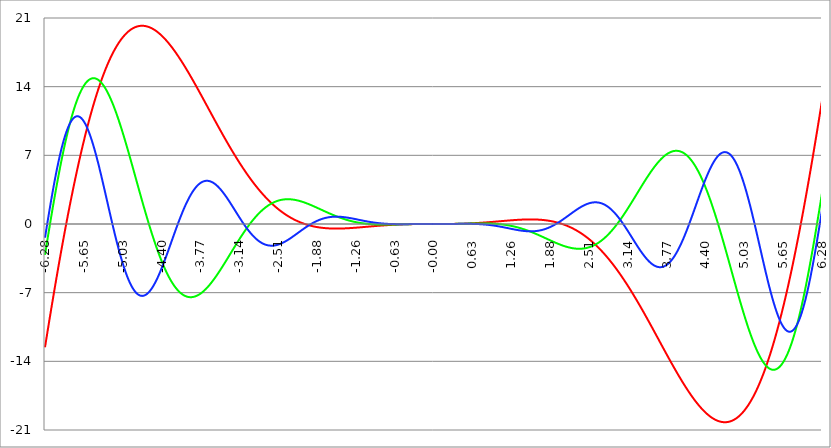
| Category | Series 1 | Series 0 | Series 2 |
|---|---|---|---|
| -6.283185307179586 | -12.566 | -3.142 | -1.396 |
| -6.276902121872407 | -12.319 | -2.894 | -1.148 |
| -6.270618936565228 | -12.071 | -2.647 | -0.901 |
| -6.264335751258049 | -11.824 | -2.4 | -0.655 |
| -6.25805256595087 | -11.578 | -2.154 | -0.409 |
| -6.25176938064369 | -11.333 | -1.908 | -0.164 |
| -6.245486195336511 | -11.087 | -1.664 | 0.08 |
| -6.23920301002933 | -10.843 | -1.42 | 0.323 |
| -6.232919824722153 | -10.599 | -1.176 | 0.565 |
| -6.226636639414973 | -10.355 | -0.934 | 0.806 |
| -6.220353454107794 | -10.112 | -0.692 | 1.045 |
| -6.214070268800615 | -9.87 | -0.451 | 1.283 |
| -6.207787083493435 | -9.628 | -0.212 | 1.52 |
| -6.201503898186257 | -9.387 | 0.027 | 1.755 |
| -6.195220712879077 | -9.146 | 0.265 | 1.989 |
| -6.188937527571898 | -8.907 | 0.502 | 2.221 |
| -6.182654342264719 | -8.667 | 0.738 | 2.451 |
| -6.17637115695754 | -8.429 | 0.973 | 2.679 |
| -6.170087971650361 | -8.191 | 1.206 | 2.906 |
| -6.163804786343182 | -7.953 | 1.439 | 3.13 |
| -6.157521601036002 | -7.717 | 1.67 | 3.353 |
| -6.151238415728823 | -7.481 | 1.9 | 3.573 |
| -6.144955230421644 | -7.245 | 2.129 | 3.792 |
| -6.138672045114464 | -7.011 | 2.357 | 4.008 |
| -6.132388859807286 | -6.777 | 2.583 | 4.221 |
| -6.126105674500106 | -6.543 | 2.808 | 4.433 |
| -6.119822489192927 | -6.311 | 3.032 | 4.642 |
| -6.113539303885748 | -6.079 | 3.254 | 4.848 |
| -6.107256118578569 | -5.848 | 3.475 | 5.052 |
| -6.10097293327139 | -5.618 | 3.694 | 5.253 |
| -6.09468974796421 | -5.388 | 3.912 | 5.451 |
| -6.088406562657031 | -5.159 | 4.128 | 5.647 |
| -6.082123377349852 | -4.931 | 4.343 | 5.84 |
| -6.075840192042672 | -4.704 | 4.556 | 6.03 |
| -6.069557006735494 | -4.477 | 4.767 | 6.217 |
| -6.063273821428314 | -4.251 | 4.977 | 6.401 |
| -6.056990636121135 | -4.026 | 5.185 | 6.582 |
| -6.050707450813956 | -3.802 | 5.392 | 6.76 |
| -6.044424265506777 | -3.578 | 5.596 | 6.934 |
| -6.038141080199597 | -3.356 | 5.799 | 7.106 |
| -6.031857894892418 | -3.134 | 6.001 | 7.274 |
| -6.025574709585239 | -2.913 | 6.2 | 7.439 |
| -6.01929152427806 | -2.693 | 6.398 | 7.601 |
| -6.013008338970881 | -2.473 | 6.593 | 7.759 |
| -6.006725153663701 | -2.255 | 6.787 | 7.914 |
| -6.000441968356522 | -2.037 | 6.979 | 8.065 |
| -5.994158783049343 | -1.82 | 7.169 | 8.213 |
| -5.987875597742164 | -1.604 | 7.357 | 8.357 |
| -5.981592412434984 | -1.389 | 7.543 | 8.498 |
| -5.975309227127805 | -1.175 | 7.728 | 8.635 |
| -5.969026041820626 | -0.962 | 7.91 | 8.769 |
| -5.962742856513447 | -0.749 | 8.09 | 8.898 |
| -5.956459671206268 | -0.538 | 8.268 | 9.024 |
| -5.950176485899088 | -0.327 | 8.444 | 9.147 |
| -5.94389330059191 | -0.117 | 8.618 | 9.265 |
| -5.93761011528473 | 0.092 | 8.789 | 9.38 |
| -5.931326929977551 | 0.3 | 8.959 | 9.491 |
| -5.925043744670372 | 0.507 | 9.126 | 9.598 |
| -5.918760559363193 | 0.713 | 9.292 | 9.701 |
| -5.912477374056014 | 0.918 | 9.455 | 9.8 |
| -5.906194188748834 | 1.122 | 9.616 | 9.895 |
| -5.899911003441655 | 1.326 | 9.774 | 9.987 |
| -5.893627818134476 | 1.528 | 9.931 | 10.074 |
| -5.887344632827297 | 1.729 | 10.085 | 10.157 |
| -5.881061447520117 | 1.93 | 10.237 | 10.237 |
| -5.874778262212938 | 2.129 | 10.386 | 10.312 |
| -5.868495076905759 | 2.328 | 10.534 | 10.384 |
| -5.86221189159858 | 2.525 | 10.679 | 10.451 |
| -5.855928706291401 | 2.722 | 10.821 | 10.515 |
| -5.849645520984221 | 2.918 | 10.962 | 10.574 |
| -5.843362335677042 | 3.112 | 11.1 | 10.629 |
| -5.837079150369863 | 3.306 | 11.235 | 10.681 |
| -5.830795965062684 | 3.498 | 11.368 | 10.728 |
| -5.824512779755505 | 3.69 | 11.499 | 10.771 |
| -5.818229594448325 | 3.881 | 11.627 | 10.811 |
| -5.811946409141146 | 4.07 | 11.753 | 10.846 |
| -5.805663223833967 | 4.259 | 11.877 | 10.877 |
| -5.799380038526788 | 4.446 | 11.998 | 10.904 |
| -5.793096853219609 | 4.633 | 12.117 | 10.927 |
| -5.78681366791243 | 4.819 | 12.233 | 10.946 |
| -5.780530482605251 | 5.003 | 12.347 | 10.962 |
| -5.774247297298071 | 5.186 | 12.458 | 10.973 |
| -5.767964111990892 | 5.369 | 12.567 | 10.98 |
| -5.761680926683713 | 5.55 | 12.673 | 10.983 |
| -5.755397741376534 | 5.731 | 12.777 | 10.983 |
| -5.749114556069355 | 5.91 | 12.878 | 10.978 |
| -5.742831370762175 | 6.088 | 12.977 | 10.97 |
| -5.736548185454996 | 6.265 | 13.073 | 10.957 |
| -5.730265000147816 | 6.441 | 13.167 | 10.941 |
| -5.723981814840638 | 6.616 | 13.258 | 10.921 |
| -5.717698629533459 | 6.79 | 13.347 | 10.897 |
| -5.711415444226279 | 6.963 | 13.433 | 10.87 |
| -5.7051322589191 | 7.135 | 13.517 | 10.838 |
| -5.698849073611921 | 7.306 | 13.598 | 10.803 |
| -5.692565888304742 | 7.476 | 13.676 | 10.764 |
| -5.686282702997562 | 7.644 | 13.753 | 10.722 |
| -5.679999517690383 | 7.812 | 13.826 | 10.676 |
| -5.673716332383204 | 7.978 | 13.897 | 10.626 |
| -5.667433147076025 | 8.143 | 13.965 | 10.573 |
| -5.661149961768846 | 8.307 | 14.031 | 10.516 |
| -5.654866776461667 | 8.471 | 14.095 | 10.455 |
| -5.648583591154487 | 8.633 | 14.156 | 10.392 |
| -5.642300405847308 | 8.793 | 14.214 | 10.324 |
| -5.63601722054013 | 8.953 | 14.27 | 10.254 |
| -5.62973403523295 | 9.112 | 14.323 | 10.18 |
| -5.623450849925771 | 9.269 | 14.373 | 10.102 |
| -5.617167664618591 | 9.426 | 14.422 | 10.022 |
| -5.610884479311412 | 9.581 | 14.467 | 9.938 |
| -5.604601294004233 | 9.735 | 14.51 | 9.851 |
| -5.598318108697054 | 9.889 | 14.551 | 9.761 |
| -5.592034923389875 | 10.04 | 14.589 | 9.668 |
| -5.585751738082695 | 10.191 | 14.625 | 9.572 |
| -5.579468552775516 | 10.341 | 14.658 | 9.473 |
| -5.573185367468337 | 10.49 | 14.688 | 9.371 |
| -5.566902182161157 | 10.637 | 14.716 | 9.266 |
| -5.560618996853979 | 10.783 | 14.742 | 9.158 |
| -5.5543358115468 | 10.928 | 14.765 | 9.047 |
| -5.54805262623962 | 11.072 | 14.786 | 8.934 |
| -5.54176944093244 | 11.215 | 14.804 | 8.818 |
| -5.535486255625262 | 11.357 | 14.82 | 8.699 |
| -5.529203070318083 | 11.498 | 14.833 | 8.578 |
| -5.522919885010904 | 11.637 | 14.844 | 8.455 |
| -5.516636699703724 | 11.775 | 14.852 | 8.328 |
| -5.510353514396545 | 11.913 | 14.858 | 8.2 |
| -5.504070329089366 | 12.049 | 14.862 | 8.069 |
| -5.497787143782186 | 12.184 | 14.863 | 7.936 |
| -5.491503958475008 | 12.317 | 14.862 | 7.8 |
| -5.485220773167828 | 12.45 | 14.858 | 7.663 |
| -5.47893758786065 | 12.581 | 14.852 | 7.523 |
| -5.47265440255347 | 12.711 | 14.844 | 7.381 |
| -5.466371217246291 | 12.841 | 14.833 | 7.238 |
| -5.460088031939112 | 12.968 | 14.82 | 7.092 |
| -5.453804846631932 | 13.095 | 14.805 | 6.945 |
| -5.447521661324753 | 13.221 | 14.787 | 6.795 |
| -5.441238476017574 | 13.345 | 14.768 | 6.644 |
| -5.434955290710395 | 13.469 | 14.745 | 6.492 |
| -5.428672105403215 | 13.591 | 14.721 | 6.337 |
| -5.422388920096036 | 13.712 | 14.694 | 6.182 |
| -5.416105734788857 | 13.832 | 14.666 | 6.024 |
| -5.409822549481678 | 13.95 | 14.634 | 5.865 |
| -5.403539364174499 | 14.068 | 14.601 | 5.705 |
| -5.39725617886732 | 14.184 | 14.566 | 5.544 |
| -5.39097299356014 | 14.299 | 14.528 | 5.381 |
| -5.384689808252961 | 14.414 | 14.488 | 5.218 |
| -5.378406622945782 | 14.526 | 14.446 | 5.053 |
| -5.372123437638603 | 14.638 | 14.402 | 4.887 |
| -5.365840252331424 | 14.749 | 14.356 | 4.72 |
| -5.359557067024244 | 14.858 | 14.308 | 4.552 |
| -5.353273881717065 | 14.966 | 14.258 | 4.383 |
| -5.346990696409886 | 15.073 | 14.205 | 4.214 |
| -5.340707511102707 | 15.179 | 14.151 | 4.044 |
| -5.334424325795528 | 15.284 | 14.095 | 3.873 |
| -5.328141140488348 | 15.388 | 14.036 | 3.702 |
| -5.32185795518117 | 15.49 | 13.976 | 3.53 |
| -5.31557476987399 | 15.591 | 13.914 | 3.358 |
| -5.30929158456681 | 15.692 | 13.849 | 3.185 |
| -5.303008399259631 | 15.791 | 13.783 | 3.012 |
| -5.296725213952453 | 15.888 | 13.715 | 2.839 |
| -5.290442028645273 | 15.985 | 13.645 | 2.665 |
| -5.284158843338094 | 16.081 | 13.573 | 2.492 |
| -5.277875658030915 | 16.175 | 13.5 | 2.318 |
| -5.271592472723735 | 16.268 | 13.424 | 2.144 |
| -5.265309287416557 | 16.36 | 13.347 | 1.971 |
| -5.259026102109377 | 16.451 | 13.268 | 1.797 |
| -5.252742916802198 | 16.541 | 13.187 | 1.624 |
| -5.246459731495019 | 16.629 | 13.105 | 1.451 |
| -5.24017654618784 | 16.717 | 13.021 | 1.278 |
| -5.23389336088066 | 16.803 | 12.935 | 1.106 |
| -5.227610175573481 | 16.888 | 12.847 | 0.934 |
| -5.221326990266302 | 16.972 | 12.758 | 0.763 |
| -5.215043804959122 | 17.055 | 12.668 | 0.592 |
| -5.208760619651944 | 17.137 | 12.575 | 0.422 |
| -5.202477434344764 | 17.218 | 12.481 | 0.252 |
| -5.196194249037585 | 17.297 | 12.386 | 0.083 |
| -5.189911063730406 | 17.375 | 12.289 | -0.085 |
| -5.183627878423227 | 17.453 | 12.19 | -0.252 |
| -5.177344693116048 | 17.529 | 12.09 | -0.418 |
| -5.171061507808868 | 17.604 | 11.989 | -0.583 |
| -5.164778322501689 | 17.678 | 11.886 | -0.748 |
| -5.15849513719451 | 17.75 | 11.782 | -0.911 |
| -5.152211951887331 | 17.822 | 11.676 | -1.073 |
| -5.145928766580152 | 17.892 | 11.569 | -1.234 |
| -5.139645581272972 | 17.962 | 11.461 | -1.394 |
| -5.133362395965793 | 18.03 | 11.351 | -1.552 |
| -5.127079210658614 | 18.097 | 11.24 | -1.709 |
| -5.120796025351435 | 18.163 | 11.128 | -1.865 |
| -5.114512840044256 | 18.228 | 11.015 | -2.019 |
| -5.108229654737076 | 18.292 | 10.9 | -2.172 |
| -5.101946469429897 | 18.354 | 10.784 | -2.323 |
| -5.095663284122718 | 18.416 | 10.667 | -2.473 |
| -5.08938009881554 | 18.476 | 10.549 | -2.621 |
| -5.08309691350836 | 18.536 | 10.43 | -2.768 |
| -5.07681372820118 | 18.594 | 10.31 | -2.912 |
| -5.070530542894002 | 18.651 | 10.189 | -3.055 |
| -5.064247357586822 | 18.707 | 10.066 | -3.196 |
| -5.057964172279643 | 18.762 | 9.943 | -3.336 |
| -5.051680986972464 | 18.816 | 9.819 | -3.473 |
| -5.045397801665285 | 18.869 | 9.693 | -3.609 |
| -5.039114616358106 | 18.921 | 9.567 | -3.742 |
| -5.032831431050926 | 18.971 | 9.44 | -3.874 |
| -5.026548245743747 | 19.021 | 9.312 | -4.003 |
| -5.020265060436568 | 19.069 | 9.183 | -4.131 |
| -5.013981875129389 | 19.117 | 9.053 | -4.256 |
| -5.00769868982221 | 19.163 | 8.923 | -4.379 |
| -5.00141550451503 | 19.209 | 8.792 | -4.5 |
| -4.995132319207851 | 19.253 | 8.66 | -4.619 |
| -4.98884913390067 | 19.296 | 8.527 | -4.735 |
| -4.982565948593493 | 19.338 | 8.393 | -4.849 |
| -4.976282763286313 | 19.379 | 8.259 | -4.961 |
| -4.969999577979134 | 19.419 | 8.125 | -5.071 |
| -4.963716392671955 | 19.458 | 7.989 | -5.178 |
| -4.957433207364776 | 19.496 | 7.853 | -5.283 |
| -4.951150022057597 | 19.533 | 7.717 | -5.385 |
| -4.944866836750418 | 19.569 | 7.58 | -5.485 |
| -4.938583651443238 | 19.604 | 7.442 | -5.582 |
| -4.932300466136059 | 19.638 | 7.304 | -5.677 |
| -4.92601728082888 | 19.671 | 7.166 | -5.77 |
| -4.9197340955217 | 19.703 | 7.027 | -5.86 |
| -4.913450910214521 | 19.733 | 6.887 | -5.947 |
| -4.907167724907342 | 19.763 | 6.747 | -6.032 |
| -4.900884539600163 | 19.792 | 6.607 | -6.114 |
| -4.894601354292984 | 19.82 | 6.467 | -6.193 |
| -4.888318168985805 | 19.847 | 6.326 | -6.27 |
| -4.882034983678625 | 19.872 | 6.185 | -6.345 |
| -4.875751798371446 | 19.897 | 6.044 | -6.416 |
| -4.869468613064267 | 19.921 | 5.902 | -6.485 |
| -4.863185427757088 | 19.944 | 5.76 | -6.551 |
| -4.856902242449909 | 19.966 | 5.618 | -6.615 |
| -4.85061905714273 | 19.986 | 5.476 | -6.676 |
| -4.84433587183555 | 20.006 | 5.334 | -6.734 |
| -4.838052686528371 | 20.025 | 5.191 | -6.79 |
| -4.831769501221192 | 20.043 | 5.049 | -6.842 |
| -4.825486315914013 | 20.06 | 4.906 | -6.893 |
| -4.819203130606833 | 20.076 | 4.764 | -6.94 |
| -4.812919945299654 | 20.091 | 4.621 | -6.984 |
| -4.806636759992475 | 20.105 | 4.479 | -7.026 |
| -4.800353574685296 | 20.119 | 4.336 | -7.065 |
| -4.794070389378117 | 20.131 | 4.193 | -7.102 |
| -4.787787204070938 | 20.142 | 4.051 | -7.136 |
| -4.781504018763758 | 20.153 | 3.909 | -7.166 |
| -4.77522083345658 | 20.162 | 3.766 | -7.195 |
| -4.7689376481494 | 20.171 | 3.624 | -7.22 |
| -4.762654462842221 | 20.178 | 3.482 | -7.243 |
| -4.756371277535042 | 20.185 | 3.341 | -7.263 |
| -4.750088092227862 | 20.191 | 3.199 | -7.28 |
| -4.743804906920683 | 20.196 | 3.058 | -7.295 |
| -4.737521721613504 | 20.2 | 2.917 | -7.307 |
| -4.731238536306324 | 20.203 | 2.776 | -7.316 |
| -4.724955350999146 | 20.205 | 2.636 | -7.323 |
| -4.718672165691966 | 20.206 | 2.496 | -7.327 |
| -4.712388980384787 | 20.207 | 2.356 | -7.328 |
| -4.706105795077608 | 20.206 | 2.217 | -7.327 |
| -4.699822609770429 | 20.205 | 2.078 | -7.323 |
| -4.69353942446325 | 20.203 | 1.939 | -7.316 |
| -4.68725623915607 | 20.2 | 1.801 | -7.307 |
| -4.680973053848891 | 20.196 | 1.664 | -7.296 |
| -4.674689868541712 | 20.191 | 1.526 | -7.281 |
| -4.668406683234533 | 20.185 | 1.39 | -7.265 |
| -4.662123497927354 | 20.179 | 1.254 | -7.245 |
| -4.655840312620174 | 20.172 | 1.118 | -7.224 |
| -4.649557127312995 | 20.164 | 0.983 | -7.199 |
| -4.643273942005816 | 20.155 | 0.849 | -7.173 |
| -4.636990756698637 | 20.145 | 0.715 | -7.144 |
| -4.630707571391458 | 20.134 | 0.581 | -7.112 |
| -4.624424386084279 | 20.123 | 0.449 | -7.078 |
| -4.618141200777099 | 20.111 | 0.317 | -7.042 |
| -4.61185801546992 | 20.098 | 0.186 | -7.003 |
| -4.605574830162741 | 20.084 | 0.055 | -6.963 |
| -4.599291644855561 | 20.069 | -0.075 | -6.919 |
| -4.593008459548383 | 20.054 | -0.204 | -6.874 |
| -4.586725274241203 | 20.038 | -0.332 | -6.827 |
| -4.580442088934024 | 20.021 | -0.46 | -6.777 |
| -4.574158903626845 | 20.003 | -0.587 | -6.725 |
| -4.567875718319666 | 19.984 | -0.713 | -6.671 |
| -4.561592533012487 | 19.965 | -0.838 | -6.615 |
| -4.555309347705307 | 19.945 | -0.963 | -6.557 |
| -4.549026162398128 | 19.924 | -1.086 | -6.496 |
| -4.542742977090949 | 19.903 | -1.209 | -6.434 |
| -4.53645979178377 | 19.881 | -1.331 | -6.37 |
| -4.530176606476591 | 19.858 | -1.452 | -6.304 |
| -4.523893421169412 | 19.834 | -1.572 | -6.236 |
| -4.517610235862232 | 19.809 | -1.691 | -6.166 |
| -4.511327050555053 | 19.784 | -1.809 | -6.095 |
| -4.505043865247874 | 19.758 | -1.926 | -6.021 |
| -4.498760679940694 | 19.732 | -2.042 | -5.946 |
| -4.492477494633515 | 19.704 | -2.158 | -5.869 |
| -4.486194309326336 | 19.676 | -2.272 | -5.791 |
| -4.479911124019157 | 19.648 | -2.385 | -5.71 |
| -4.473627938711977 | 19.618 | -2.497 | -5.629 |
| -4.467344753404799 | 19.588 | -2.609 | -5.545 |
| -4.46106156809762 | 19.558 | -2.719 | -5.46 |
| -4.45477838279044 | 19.526 | -2.828 | -5.374 |
| -4.44849519748326 | 19.494 | -2.936 | -5.286 |
| -4.442212012176082 | 19.461 | -3.043 | -5.197 |
| -4.435928826868903 | 19.428 | -3.148 | -5.107 |
| -4.429645641561723 | 19.394 | -3.253 | -5.015 |
| -4.423362456254544 | 19.359 | -3.356 | -4.922 |
| -4.417079270947365 | 19.324 | -3.459 | -4.827 |
| -4.410796085640185 | 19.288 | -3.56 | -4.732 |
| -4.404512900333007 | 19.251 | -3.66 | -4.635 |
| -4.398229715025827 | 19.214 | -3.759 | -4.537 |
| -4.391946529718648 | 19.176 | -3.857 | -4.438 |
| -4.38566334441147 | 19.137 | -3.953 | -4.339 |
| -4.37938015910429 | 19.098 | -4.049 | -4.238 |
| -4.373096973797111 | 19.059 | -4.143 | -4.136 |
| -4.366813788489932 | 19.018 | -4.236 | -4.033 |
| -4.360530603182752 | 18.977 | -4.328 | -3.93 |
| -4.354247417875573 | 18.936 | -4.418 | -3.825 |
| -4.347964232568394 | 18.894 | -4.507 | -3.72 |
| -4.341681047261215 | 18.851 | -4.595 | -3.614 |
| -4.335397861954035 | 18.808 | -4.682 | -3.508 |
| -4.329114676646856 | 18.764 | -4.767 | -3.401 |
| -4.322831491339677 | 18.72 | -4.852 | -3.293 |
| -4.316548306032498 | 18.675 | -4.934 | -3.185 |
| -4.310265120725319 | 18.63 | -5.016 | -3.076 |
| -4.30398193541814 | 18.584 | -5.096 | -2.966 |
| -4.29769875011096 | 18.537 | -5.175 | -2.857 |
| -4.291415564803781 | 18.49 | -5.253 | -2.747 |
| -4.285132379496602 | 18.443 | -5.33 | -2.636 |
| -4.278849194189422 | 18.395 | -5.405 | -2.525 |
| -4.272566008882244 | 18.346 | -5.478 | -2.414 |
| -4.266282823575064 | 18.297 | -5.551 | -2.303 |
| -4.259999638267885 | 18.247 | -5.622 | -2.192 |
| -4.253716452960706 | 18.197 | -5.692 | -2.08 |
| -4.247433267653527 | 18.147 | -5.76 | -1.969 |
| -4.241150082346347 | 18.096 | -5.827 | -1.857 |
| -4.234866897039168 | 18.044 | -5.893 | -1.746 |
| -4.228583711731989 | 17.992 | -5.958 | -1.634 |
| -4.22230052642481 | 17.94 | -6.021 | -1.523 |
| -4.216017341117631 | 17.887 | -6.082 | -1.411 |
| -4.209734155810452 | 17.833 | -6.143 | -1.3 |
| -4.203450970503273 | 17.779 | -6.202 | -1.189 |
| -4.197167785196093 | 17.725 | -6.259 | -1.078 |
| -4.190884599888914 | 17.67 | -6.315 | -0.968 |
| -4.184601414581734 | 17.615 | -6.37 | -0.857 |
| -4.178318229274556 | 17.56 | -6.424 | -0.748 |
| -4.172035043967377 | 17.503 | -6.476 | -0.638 |
| -4.165751858660197 | 17.447 | -6.527 | -0.529 |
| -4.159468673353018 | 17.39 | -6.576 | -0.421 |
| -4.153185488045839 | 17.333 | -6.624 | -0.313 |
| -4.14690230273866 | 17.275 | -6.671 | -0.205 |
| -4.140619117431481 | 17.217 | -6.716 | -0.098 |
| -4.134335932124301 | 17.159 | -6.76 | 0.008 |
| -4.128052746817122 | 17.1 | -6.803 | 0.114 |
| -4.121769561509943 | 17.04 | -6.844 | 0.219 |
| -4.115486376202764 | 16.981 | -6.884 | 0.323 |
| -4.109203190895584 | 16.921 | -6.922 | 0.426 |
| -4.102920005588405 | 16.86 | -6.96 | 0.529 |
| -4.096636820281226 | 16.8 | -6.995 | 0.631 |
| -4.090353634974047 | 16.739 | -7.03 | 0.732 |
| -4.084070449666868 | 16.677 | -7.063 | 0.832 |
| -4.077787264359689 | 16.615 | -7.095 | 0.931 |
| -4.071504079052509 | 16.553 | -7.125 | 1.03 |
| -4.06522089374533 | 16.491 | -7.154 | 1.127 |
| -4.058937708438151 | 16.428 | -7.182 | 1.223 |
| -4.052654523130972 | 16.365 | -7.208 | 1.318 |
| -4.046371337823793 | 16.302 | -7.233 | 1.412 |
| -4.040088152516613 | 16.238 | -7.257 | 1.506 |
| -4.033804967209434 | 16.174 | -7.279 | 1.598 |
| -4.027521781902255 | 16.11 | -7.3 | 1.688 |
| -4.021238596595076 | 16.045 | -7.32 | 1.778 |
| -4.014955411287897 | 15.98 | -7.338 | 1.866 |
| -4.008672225980717 | 15.915 | -7.355 | 1.954 |
| -4.002389040673538 | 15.849 | -7.371 | 2.04 |
| -3.996105855366359 | 15.784 | -7.385 | 2.124 |
| -3.989822670059179 | 15.718 | -7.399 | 2.208 |
| -3.983539484752 | 15.651 | -7.41 | 2.29 |
| -3.97725629944482 | 15.585 | -7.421 | 2.37 |
| -3.97097311413764 | 15.518 | -7.43 | 2.45 |
| -3.96468992883046 | 15.451 | -7.438 | 2.528 |
| -3.958406743523281 | 15.384 | -7.445 | 2.604 |
| -3.952123558216101 | 15.316 | -7.451 | 2.679 |
| -3.945840372908922 | 15.248 | -7.455 | 2.753 |
| -3.939557187601742 | 15.18 | -7.458 | 2.825 |
| -3.933274002294562 | 15.112 | -7.46 | 2.896 |
| -3.926990816987382 | 15.044 | -7.461 | 2.965 |
| -3.920707631680203 | 14.975 | -7.46 | 3.033 |
| -3.914424446373023 | 14.906 | -7.458 | 3.099 |
| -3.908141261065844 | 14.837 | -7.455 | 3.164 |
| -3.901858075758664 | 14.768 | -7.451 | 3.227 |
| -3.895574890451484 | 14.699 | -7.446 | 3.289 |
| -3.889291705144305 | 14.629 | -7.439 | 3.349 |
| -3.883008519837125 | 14.559 | -7.431 | 3.407 |
| -3.876725334529945 | 14.489 | -7.422 | 3.464 |
| -3.870442149222766 | 14.419 | -7.412 | 3.519 |
| -3.864158963915586 | 14.349 | -7.401 | 3.573 |
| -3.857875778608407 | 14.279 | -7.389 | 3.625 |
| -3.851592593301227 | 14.208 | -7.375 | 3.675 |
| -3.845309407994047 | 14.137 | -7.361 | 3.723 |
| -3.839026222686868 | 14.066 | -7.345 | 3.77 |
| -3.832743037379688 | 13.995 | -7.328 | 3.816 |
| -3.826459852072508 | 13.924 | -7.311 | 3.859 |
| -3.820176666765329 | 13.853 | -7.292 | 3.901 |
| -3.813893481458149 | 13.781 | -7.272 | 3.942 |
| -3.807610296150969 | 13.71 | -7.251 | 3.98 |
| -3.80132711084379 | 13.638 | -7.229 | 4.017 |
| -3.79504392553661 | 13.566 | -7.205 | 4.052 |
| -3.78876074022943 | 13.494 | -7.181 | 4.086 |
| -3.782477554922251 | 13.422 | -7.156 | 4.118 |
| -3.776194369615071 | 13.35 | -7.13 | 4.148 |
| -3.769911184307892 | 13.278 | -7.103 | 4.176 |
| -3.763627999000712 | 13.206 | -7.075 | 4.203 |
| -3.757344813693532 | 13.133 | -7.046 | 4.228 |
| -3.751061628386352 | 13.061 | -7.016 | 4.251 |
| -3.744778443079173 | 12.988 | -6.985 | 4.273 |
| -3.738495257771993 | 12.916 | -6.953 | 4.293 |
| -3.732212072464814 | 12.843 | -6.92 | 4.311 |
| -3.725928887157634 | 12.77 | -6.887 | 4.328 |
| -3.719645701850454 | 12.698 | -6.852 | 4.343 |
| -3.713362516543275 | 12.625 | -6.817 | 4.356 |
| -3.707079331236095 | 12.552 | -6.78 | 4.368 |
| -3.700796145928915 | 12.479 | -6.743 | 4.378 |
| -3.694512960621736 | 12.406 | -6.705 | 4.386 |
| -3.688229775314556 | 12.333 | -6.666 | 4.393 |
| -3.681946590007376 | 12.26 | -6.626 | 4.398 |
| -3.675663404700197 | 12.187 | -6.586 | 4.402 |
| -3.669380219393017 | 12.114 | -6.545 | 4.403 |
| -3.663097034085838 | 12.041 | -6.503 | 4.404 |
| -3.656813848778658 | 11.968 | -6.46 | 4.402 |
| -3.650530663471478 | 11.895 | -6.416 | 4.399 |
| -3.644247478164299 | 11.821 | -6.372 | 4.395 |
| -3.63796429285712 | 11.748 | -6.327 | 4.389 |
| -3.631681107549939 | 11.675 | -6.281 | 4.381 |
| -3.62539792224276 | 11.602 | -6.234 | 4.372 |
| -3.61911473693558 | 11.529 | -6.187 | 4.362 |
| -3.612831551628401 | 11.456 | -6.139 | 4.35 |
| -3.606548366321221 | 11.383 | -6.091 | 4.336 |
| -3.600265181014041 | 11.31 | -6.042 | 4.321 |
| -3.593981995706862 | 11.237 | -5.992 | 4.305 |
| -3.587698810399682 | 11.164 | -5.941 | 4.287 |
| -3.581415625092502 | 11.091 | -5.89 | 4.267 |
| -3.575132439785323 | 11.018 | -5.839 | 4.247 |
| -3.568849254478143 | 10.945 | -5.786 | 4.225 |
| -3.562566069170964 | 10.872 | -5.734 | 4.201 |
| -3.556282883863784 | 10.8 | -5.68 | 4.176 |
| -3.549999698556604 | 10.727 | -5.626 | 4.15 |
| -3.543716513249425 | 10.654 | -5.572 | 4.123 |
| -3.537433327942245 | 10.582 | -5.517 | 4.094 |
| -3.531150142635065 | 10.509 | -5.461 | 4.064 |
| -3.524866957327886 | 10.437 | -5.405 | 4.032 |
| -3.518583772020706 | 10.364 | -5.349 | 4 |
| -3.512300586713526 | 10.292 | -5.292 | 3.966 |
| -3.506017401406347 | 10.22 | -5.234 | 3.931 |
| -3.499734216099167 | 10.148 | -5.177 | 3.895 |
| -3.493451030791987 | 10.076 | -5.118 | 3.858 |
| -3.487167845484808 | 10.004 | -5.06 | 3.82 |
| -3.480884660177628 | 9.932 | -5.001 | 3.78 |
| -3.474601474870449 | 9.86 | -4.941 | 3.74 |
| -3.468318289563269 | 9.788 | -4.881 | 3.698 |
| -3.462035104256089 | 9.717 | -4.821 | 3.656 |
| -3.45575191894891 | 9.646 | -4.761 | 3.612 |
| -3.44946873364173 | 9.574 | -4.7 | 3.567 |
| -3.44318554833455 | 9.503 | -4.639 | 3.522 |
| -3.436902363027371 | 9.432 | -4.577 | 3.475 |
| -3.430619177720191 | 9.361 | -4.515 | 3.428 |
| -3.424335992413011 | 9.29 | -4.453 | 3.38 |
| -3.418052807105832 | 9.22 | -4.391 | 3.33 |
| -3.411769621798652 | 9.149 | -4.328 | 3.28 |
| -3.405486436491473 | 9.079 | -4.265 | 3.23 |
| -3.399203251184293 | 9.008 | -4.202 | 3.178 |
| -3.392920065877113 | 8.938 | -4.139 | 3.126 |
| -3.386636880569934 | 8.868 | -4.076 | 3.073 |
| -3.380353695262754 | 8.798 | -4.012 | 3.019 |
| -3.374070509955574 | 8.729 | -3.948 | 2.964 |
| -3.367787324648395 | 8.659 | -3.884 | 2.909 |
| -3.361504139341215 | 8.59 | -3.82 | 2.853 |
| -3.355220954034035 | 8.521 | -3.756 | 2.797 |
| -3.348937768726855 | 8.452 | -3.691 | 2.74 |
| -3.342654583419676 | 8.383 | -3.627 | 2.682 |
| -3.336371398112496 | 8.314 | -3.562 | 2.624 |
| -3.330088212805317 | 8.245 | -3.497 | 2.566 |
| -3.323805027498137 | 8.177 | -3.432 | 2.507 |
| -3.317521842190957 | 8.109 | -3.368 | 2.447 |
| -3.311238656883778 | 8.041 | -3.303 | 2.387 |
| -3.304955471576598 | 7.973 | -3.238 | 2.327 |
| -3.298672286269419 | 7.905 | -3.173 | 2.266 |
| -3.292389100962239 | 7.838 | -3.108 | 2.205 |
| -3.286105915655059 | 7.771 | -3.043 | 2.144 |
| -3.27982273034788 | 7.704 | -2.978 | 2.082 |
| -3.2735395450407 | 7.637 | -2.912 | 2.02 |
| -3.26725635973352 | 7.57 | -2.848 | 1.958 |
| -3.260973174426341 | 7.504 | -2.783 | 1.895 |
| -3.254689989119161 | 7.438 | -2.718 | 1.833 |
| -3.248406803811982 | 7.372 | -2.653 | 1.77 |
| -3.242123618504802 | 7.306 | -2.588 | 1.707 |
| -3.235840433197622 | 7.24 | -2.523 | 1.644 |
| -3.229557247890442 | 7.175 | -2.459 | 1.58 |
| -3.223274062583263 | 7.11 | -2.394 | 1.517 |
| -3.216990877276083 | 7.045 | -2.33 | 1.454 |
| -3.210707691968904 | 6.98 | -2.266 | 1.39 |
| -3.204424506661724 | 6.915 | -2.202 | 1.327 |
| -3.198141321354544 | 6.851 | -2.138 | 1.264 |
| -3.191858136047365 | 6.787 | -2.074 | 1.2 |
| -3.185574950740185 | 6.723 | -2.01 | 1.137 |
| -3.179291765433005 | 6.66 | -1.947 | 1.074 |
| -3.173008580125826 | 6.596 | -1.884 | 1.011 |
| -3.166725394818646 | 6.533 | -1.821 | 0.948 |
| -3.160442209511467 | 6.47 | -1.758 | 0.885 |
| -3.154159024204287 | 6.408 | -1.695 | 0.823 |
| -3.147875838897107 | 6.345 | -1.633 | 0.76 |
| -3.141592653589928 | 6.283 | -1.571 | 0.698 |
| -3.135309468282748 | 6.221 | -1.509 | 0.636 |
| -3.129026282975568 | 6.16 | -1.447 | 0.575 |
| -3.122743097668389 | 6.098 | -1.386 | 0.513 |
| -3.116459912361209 | 6.037 | -1.325 | 0.452 |
| -3.110176727054029 | 5.976 | -1.264 | 0.392 |
| -3.10389354174685 | 5.916 | -1.204 | 0.331 |
| -3.09761035643967 | 5.855 | -1.143 | 0.271 |
| -3.09132717113249 | 5.795 | -1.083 | 0.212 |
| -3.085043985825311 | 5.735 | -1.024 | 0.153 |
| -3.078760800518131 | 5.676 | -0.965 | 0.094 |
| -3.072477615210952 | 5.616 | -0.906 | 0.036 |
| -3.066194429903772 | 5.557 | -0.847 | -0.022 |
| -3.059911244596592 | 5.499 | -0.789 | -0.08 |
| -3.053628059289413 | 5.44 | -0.731 | -0.136 |
| -3.047344873982233 | 5.382 | -0.673 | -0.193 |
| -3.041061688675053 | 5.324 | -0.616 | -0.248 |
| -3.034778503367874 | 5.266 | -0.56 | -0.304 |
| -3.028495318060694 | 5.209 | -0.503 | -0.358 |
| -3.022212132753515 | 5.152 | -0.447 | -0.412 |
| -3.015928947446335 | 5.095 | -0.392 | -0.466 |
| -3.009645762139155 | 5.038 | -0.337 | -0.519 |
| -3.003362576831975 | 4.982 | -0.282 | -0.571 |
| -2.997079391524796 | 4.926 | -0.228 | -0.622 |
| -2.990796206217616 | 4.87 | -0.174 | -0.673 |
| -2.984513020910436 | 4.815 | -0.12 | -0.723 |
| -2.978229835603257 | 4.76 | -0.067 | -0.773 |
| -2.971946650296077 | 4.705 | -0.015 | -0.822 |
| -2.965663464988898 | 4.65 | 0.037 | -0.87 |
| -2.959380279681718 | 4.596 | 0.089 | -0.917 |
| -2.953097094374538 | 4.542 | 0.14 | -0.964 |
| -2.946813909067359 | 4.489 | 0.191 | -1.01 |
| -2.94053072376018 | 4.435 | 0.241 | -1.055 |
| -2.934247538453 | 4.382 | 0.291 | -1.099 |
| -2.92796435314582 | 4.329 | 0.34 | -1.143 |
| -2.92168116783864 | 4.277 | 0.389 | -1.186 |
| -2.915397982531461 | 4.225 | 0.437 | -1.228 |
| -2.909114797224281 | 4.173 | 0.485 | -1.269 |
| -2.902831611917101 | 4.121 | 0.532 | -1.309 |
| -2.896548426609922 | 4.07 | 0.579 | -1.349 |
| -2.890265241302742 | 4.019 | 0.625 | -1.387 |
| -2.883982055995562 | 3.968 | 0.671 | -1.425 |
| -2.877698870688383 | 3.918 | 0.716 | -1.462 |
| -2.871415685381203 | 3.868 | 0.761 | -1.498 |
| -2.865132500074023 | 3.818 | 0.805 | -1.533 |
| -2.858849314766844 | 3.768 | 0.849 | -1.568 |
| -2.852566129459664 | 3.719 | 0.892 | -1.601 |
| -2.846282944152485 | 3.67 | 0.934 | -1.634 |
| -2.839999758845305 | 3.622 | 0.976 | -1.666 |
| -2.833716573538125 | 3.574 | 1.018 | -1.697 |
| -2.827433388230946 | 3.526 | 1.059 | -1.727 |
| -2.821150202923766 | 3.478 | 1.099 | -1.756 |
| -2.814867017616586 | 3.431 | 1.139 | -1.784 |
| -2.808583832309407 | 3.384 | 1.178 | -1.811 |
| -2.802300647002227 | 3.337 | 1.217 | -1.838 |
| -2.796017461695047 | 3.291 | 1.255 | -1.863 |
| -2.789734276387867 | 3.245 | 1.293 | -1.888 |
| -2.783451091080688 | 3.199 | 1.33 | -1.911 |
| -2.777167905773509 | 3.154 | 1.366 | -1.934 |
| -2.770884720466329 | 3.108 | 1.402 | -1.956 |
| -2.764601535159149 | 3.064 | 1.437 | -1.977 |
| -2.75831834985197 | 3.019 | 1.472 | -1.997 |
| -2.75203516454479 | 2.975 | 1.506 | -2.016 |
| -2.74575197923761 | 2.931 | 1.54 | -2.034 |
| -2.739468793930431 | 2.888 | 1.573 | -2.051 |
| -2.733185608623251 | 2.844 | 1.605 | -2.067 |
| -2.726902423316071 | 2.801 | 1.637 | -2.083 |
| -2.720619238008892 | 2.759 | 1.668 | -2.097 |
| -2.714336052701712 | 2.716 | 1.699 | -2.111 |
| -2.708052867394532 | 2.674 | 1.729 | -2.124 |
| -2.701769682087352 | 2.633 | 1.758 | -2.136 |
| -2.695486496780173 | 2.591 | 1.787 | -2.147 |
| -2.689203311472993 | 2.55 | 1.816 | -2.157 |
| -2.682920126165814 | 2.51 | 1.844 | -2.166 |
| -2.676636940858634 | 2.469 | 1.871 | -2.174 |
| -2.670353755551454 | 2.429 | 1.897 | -2.182 |
| -2.664070570244275 | 2.39 | 1.923 | -2.188 |
| -2.657787384937095 | 2.35 | 1.949 | -2.194 |
| -2.651504199629916 | 2.311 | 1.974 | -2.199 |
| -2.645221014322736 | 2.272 | 1.998 | -2.203 |
| -2.638937829015556 | 2.234 | 2.022 | -2.206 |
| -2.632654643708377 | 2.195 | 2.045 | -2.208 |
| -2.626371458401197 | 2.158 | 2.068 | -2.21 |
| -2.620088273094018 | 2.12 | 2.09 | -2.211 |
| -2.613805087786838 | 2.083 | 2.111 | -2.21 |
| -2.607521902479658 | 2.046 | 2.132 | -2.209 |
| -2.601238717172478 | 2.009 | 2.152 | -2.208 |
| -2.594955531865299 | 1.973 | 2.172 | -2.205 |
| -2.588672346558119 | 1.937 | 2.191 | -2.202 |
| -2.58238916125094 | 1.901 | 2.21 | -2.198 |
| -2.57610597594376 | 1.866 | 2.228 | -2.193 |
| -2.56982279063658 | 1.831 | 2.245 | -2.187 |
| -2.563539605329401 | 1.796 | 2.262 | -2.181 |
| -2.557256420022221 | 1.762 | 2.278 | -2.174 |
| -2.550973234715042 | 1.728 | 2.294 | -2.166 |
| -2.544690049407862 | 1.694 | 2.31 | -2.158 |
| -2.538406864100682 | 1.66 | 2.324 | -2.148 |
| -2.532123678793503 | 1.627 | 2.338 | -2.138 |
| -2.525840493486323 | 1.594 | 2.352 | -2.128 |
| -2.519557308179143 | 1.562 | 2.365 | -2.117 |
| -2.513274122871964 | 1.529 | 2.378 | -2.105 |
| -2.506990937564784 | 1.497 | 2.39 | -2.092 |
| -2.500707752257604 | 1.466 | 2.401 | -2.079 |
| -2.494424566950425 | 1.434 | 2.412 | -2.065 |
| -2.488141381643245 | 1.403 | 2.422 | -2.05 |
| -2.481858196336065 | 1.373 | 2.432 | -2.035 |
| -2.475575011028886 | 1.342 | 2.442 | -2.02 |
| -2.469291825721706 | 1.312 | 2.451 | -2.003 |
| -2.463008640414527 | 1.282 | 2.459 | -1.987 |
| -2.456725455107347 | 1.253 | 2.467 | -1.969 |
| -2.450442269800167 | 1.224 | 2.474 | -1.951 |
| -2.444159084492988 | 1.195 | 2.481 | -1.933 |
| -2.437875899185808 | 1.166 | 2.487 | -1.914 |
| -2.431592713878628 | 1.138 | 2.493 | -1.895 |
| -2.425309528571449 | 1.11 | 2.498 | -1.875 |
| -2.419026343264269 | 1.082 | 2.503 | -1.854 |
| -2.412743157957089 | 1.054 | 2.508 | -1.833 |
| -2.40645997264991 | 1.027 | 2.511 | -1.812 |
| -2.40017678734273 | 1 | 2.515 | -1.79 |
| -2.393893602035551 | 0.974 | 2.518 | -1.768 |
| -2.387610416728371 | 0.948 | 2.52 | -1.745 |
| -2.381327231421191 | 0.922 | 2.522 | -1.722 |
| -2.375044046114012 | 0.896 | 2.524 | -1.699 |
| -2.368760860806832 | 0.871 | 2.525 | -1.675 |
| -2.362477675499652 | 0.846 | 2.526 | -1.651 |
| -2.356194490192473 | 0.821 | 2.526 | -1.626 |
| -2.349911304885293 | 0.796 | 2.526 | -1.602 |
| -2.343628119578113 | 0.772 | 2.525 | -1.576 |
| -2.337344934270934 | 0.748 | 2.524 | -1.551 |
| -2.331061748963754 | 0.724 | 2.522 | -1.525 |
| -2.324778563656574 | 0.701 | 2.52 | -1.499 |
| -2.318495378349395 | 0.678 | 2.518 | -1.473 |
| -2.312212193042215 | 0.655 | 2.515 | -1.446 |
| -2.305929007735036 | 0.633 | 2.512 | -1.42 |
| -2.299645822427856 | 0.61 | 2.509 | -1.393 |
| -2.293362637120676 | 0.588 | 2.505 | -1.365 |
| -2.287079451813496 | 0.567 | 2.5 | -1.338 |
| -2.280796266506317 | 0.545 | 2.496 | -1.31 |
| -2.274513081199137 | 0.524 | 2.491 | -1.282 |
| -2.268229895891957 | 0.503 | 2.485 | -1.255 |
| -2.261946710584778 | 0.482 | 2.479 | -1.226 |
| -2.255663525277598 | 0.462 | 2.473 | -1.198 |
| -2.249380339970419 | 0.442 | 2.466 | -1.17 |
| -2.24309715466324 | 0.422 | 2.46 | -1.141 |
| -2.23681396935606 | 0.403 | 2.452 | -1.113 |
| -2.23053078404888 | 0.383 | 2.445 | -1.084 |
| -2.2242475987417 | 0.364 | 2.437 | -1.055 |
| -2.217964413434521 | 0.345 | 2.428 | -1.027 |
| -2.211681228127341 | 0.327 | 2.42 | -0.998 |
| -2.205398042820161 | 0.309 | 2.411 | -0.969 |
| -2.199114857512981 | 0.291 | 2.402 | -0.94 |
| -2.192831672205802 | 0.273 | 2.392 | -0.911 |
| -2.186548486898622 | 0.256 | 2.382 | -0.882 |
| -2.180265301591443 | 0.238 | 2.372 | -0.853 |
| -2.173982116284263 | 0.221 | 2.362 | -0.824 |
| -2.167698930977084 | 0.205 | 2.351 | -0.796 |
| -2.161415745669904 | 0.188 | 2.34 | -0.767 |
| -2.155132560362724 | 0.172 | 2.329 | -0.738 |
| -2.148849375055545 | 0.156 | 2.317 | -0.709 |
| -2.142566189748365 | 0.14 | 2.305 | -0.681 |
| -2.136283004441185 | 0.125 | 2.293 | -0.652 |
| -2.129999819134006 | 0.11 | 2.281 | -0.624 |
| -2.123716633826826 | 0.095 | 2.268 | -0.596 |
| -2.117433448519646 | 0.08 | 2.256 | -0.568 |
| -2.111150263212467 | 0.065 | 2.242 | -0.539 |
| -2.104867077905287 | 0.051 | 2.229 | -0.512 |
| -2.098583892598107 | 0.037 | 2.216 | -0.484 |
| -2.092300707290928 | 0.023 | 2.202 | -0.456 |
| -2.086017521983748 | 0.009 | 2.188 | -0.429 |
| -2.079734336676569 | -0.004 | 2.174 | -0.402 |
| -2.073451151369389 | -0.017 | 2.159 | -0.375 |
| -2.06716796606221 | -0.03 | 2.145 | -0.348 |
| -2.06088478075503 | -0.043 | 2.13 | -0.321 |
| -2.05460159544785 | -0.055 | 2.115 | -0.295 |
| -2.04831841014067 | -0.067 | 2.1 | -0.268 |
| -2.042035224833491 | -0.079 | 2.085 | -0.242 |
| -2.035752039526311 | -0.091 | 2.069 | -0.217 |
| -2.029468854219131 | -0.103 | 2.054 | -0.191 |
| -2.023185668911951 | -0.114 | 2.038 | -0.166 |
| -2.016902483604772 | -0.125 | 2.022 | -0.141 |
| -2.010619298297592 | -0.136 | 2.006 | -0.116 |
| -2.004336112990412 | -0.147 | 1.989 | -0.092 |
| -1.998052927683233 | -0.157 | 1.973 | -0.067 |
| -1.991769742376054 | -0.168 | 1.956 | -0.044 |
| -1.985486557068874 | -0.178 | 1.94 | -0.02 |
| -1.979203371761694 | -0.187 | 1.923 | 0.003 |
| -1.972920186454515 | -0.197 | 1.906 | 0.026 |
| -1.966637001147335 | -0.207 | 1.889 | 0.049 |
| -1.960353815840155 | -0.216 | 1.872 | 0.071 |
| -1.954070630532976 | -0.225 | 1.855 | 0.094 |
| -1.947787445225796 | -0.234 | 1.837 | 0.115 |
| -1.941504259918616 | -0.243 | 1.82 | 0.137 |
| -1.935221074611437 | -0.251 | 1.802 | 0.158 |
| -1.928937889304257 | -0.259 | 1.785 | 0.178 |
| -1.922654703997078 | -0.267 | 1.767 | 0.199 |
| -1.916371518689898 | -0.275 | 1.749 | 0.219 |
| -1.910088333382718 | -0.283 | 1.732 | 0.239 |
| -1.903805148075539 | -0.291 | 1.714 | 0.258 |
| -1.897521962768359 | -0.298 | 1.696 | 0.277 |
| -1.891238777461179 | -0.305 | 1.678 | 0.295 |
| -1.884955592154 | -0.312 | 1.66 | 0.314 |
| -1.87867240684682 | -0.319 | 1.642 | 0.332 |
| -1.87238922153964 | -0.326 | 1.624 | 0.349 |
| -1.866106036232461 | -0.332 | 1.605 | 0.366 |
| -1.859822850925281 | -0.338 | 1.587 | 0.383 |
| -1.853539665618102 | -0.344 | 1.569 | 0.399 |
| -1.847256480310922 | -0.35 | 1.551 | 0.415 |
| -1.840973295003742 | -0.356 | 1.532 | 0.431 |
| -1.834690109696563 | -0.362 | 1.514 | 0.446 |
| -1.828406924389383 | -0.367 | 1.496 | 0.461 |
| -1.822123739082203 | -0.372 | 1.478 | 0.476 |
| -1.815840553775024 | -0.377 | 1.459 | 0.49 |
| -1.809557368467844 | -0.382 | 1.441 | 0.503 |
| -1.803274183160664 | -0.387 | 1.423 | 0.517 |
| -1.796990997853485 | -0.392 | 1.405 | 0.53 |
| -1.790707812546305 | -0.396 | 1.386 | 0.542 |
| -1.784424627239125 | -0.401 | 1.368 | 0.554 |
| -1.778141441931946 | -0.405 | 1.35 | 0.566 |
| -1.771858256624766 | -0.409 | 1.332 | 0.577 |
| -1.765575071317587 | -0.413 | 1.314 | 0.588 |
| -1.759291886010407 | -0.416 | 1.296 | 0.599 |
| -1.753008700703227 | -0.42 | 1.277 | 0.609 |
| -1.746725515396048 | -0.423 | 1.259 | 0.619 |
| -1.740442330088868 | -0.427 | 1.241 | 0.629 |
| -1.734159144781688 | -0.43 | 1.224 | 0.638 |
| -1.727875959474509 | -0.433 | 1.206 | 0.646 |
| -1.72159277416733 | -0.436 | 1.188 | 0.655 |
| -1.715309588860149 | -0.438 | 1.17 | 0.663 |
| -1.70902640355297 | -0.441 | 1.152 | 0.67 |
| -1.70274321824579 | -0.443 | 1.135 | 0.677 |
| -1.69646003293861 | -0.446 | 1.117 | 0.684 |
| -1.690176847631431 | -0.448 | 1.1 | 0.691 |
| -1.683893662324251 | -0.45 | 1.082 | 0.697 |
| -1.677610477017072 | -0.452 | 1.065 | 0.703 |
| -1.671327291709892 | -0.454 | 1.048 | 0.708 |
| -1.665044106402712 | -0.456 | 1.031 | 0.713 |
| -1.658760921095533 | -0.457 | 1.014 | 0.718 |
| -1.652477735788353 | -0.459 | 0.997 | 0.722 |
| -1.646194550481173 | -0.46 | 0.98 | 0.726 |
| -1.639911365173994 | -0.461 | 0.963 | 0.73 |
| -1.633628179866814 | -0.462 | 0.946 | 0.733 |
| -1.627344994559634 | -0.463 | 0.93 | 0.736 |
| -1.621061809252455 | -0.464 | 0.913 | 0.739 |
| -1.614778623945275 | -0.465 | 0.897 | 0.741 |
| -1.608495438638096 | -0.466 | 0.881 | 0.743 |
| -1.602212253330916 | -0.466 | 0.864 | 0.745 |
| -1.595929068023736 | -0.467 | 0.848 | 0.746 |
| -1.589645882716557 | -0.467 | 0.832 | 0.747 |
| -1.583362697409377 | -0.467 | 0.817 | 0.748 |
| -1.577079512102197 | -0.467 | 0.801 | 0.748 |
| -1.570796326795018 | -0.467 | 0.785 | 0.748 |
| -1.564513141487838 | -0.467 | 0.77 | 0.748 |
| -1.558229956180659 | -0.467 | 0.755 | 0.748 |
| -1.551946770873479 | -0.467 | 0.739 | 0.747 |
| -1.545663585566299 | -0.467 | 0.724 | 0.746 |
| -1.53938040025912 | -0.466 | 0.709 | 0.745 |
| -1.53309721495194 | -0.466 | 0.695 | 0.743 |
| -1.52681402964476 | -0.465 | 0.68 | 0.742 |
| -1.520530844337581 | -0.464 | 0.665 | 0.739 |
| -1.514247659030401 | -0.464 | 0.651 | 0.737 |
| -1.507964473723221 | -0.463 | 0.637 | 0.735 |
| -1.501681288416042 | -0.462 | 0.623 | 0.732 |
| -1.495398103108862 | -0.461 | 0.609 | 0.729 |
| -1.489114917801682 | -0.46 | 0.595 | 0.725 |
| -1.482831732494503 | -0.459 | 0.581 | 0.722 |
| -1.476548547187323 | -0.457 | 0.568 | 0.718 |
| -1.470265361880144 | -0.456 | 0.554 | 0.714 |
| -1.463982176572964 | -0.455 | 0.541 | 0.71 |
| -1.457698991265784 | -0.453 | 0.528 | 0.706 |
| -1.451415805958605 | -0.452 | 0.515 | 0.701 |
| -1.445132620651425 | -0.45 | 0.502 | 0.697 |
| -1.438849435344245 | -0.448 | 0.49 | 0.692 |
| -1.432566250037066 | -0.447 | 0.477 | 0.687 |
| -1.426283064729886 | -0.445 | 0.465 | 0.681 |
| -1.419999879422706 | -0.443 | 0.453 | 0.676 |
| -1.413716694115527 | -0.441 | 0.441 | 0.67 |
| -1.407433508808347 | -0.439 | 0.429 | 0.664 |
| -1.401150323501168 | -0.437 | 0.417 | 0.658 |
| -1.394867138193988 | -0.435 | 0.406 | 0.652 |
| -1.388583952886808 | -0.433 | 0.394 | 0.646 |
| -1.382300767579629 | -0.43 | 0.383 | 0.64 |
| -1.376017582272449 | -0.428 | 0.372 | 0.633 |
| -1.369734396965269 | -0.426 | 0.361 | 0.627 |
| -1.36345121165809 | -0.423 | 0.35 | 0.62 |
| -1.35716802635091 | -0.421 | 0.34 | 0.613 |
| -1.35088484104373 | -0.418 | 0.329 | 0.606 |
| -1.344601655736551 | -0.416 | 0.319 | 0.599 |
| -1.338318470429371 | -0.413 | 0.309 | 0.592 |
| -1.332035285122191 | -0.411 | 0.299 | 0.585 |
| -1.325752099815012 | -0.408 | 0.289 | 0.577 |
| -1.319468914507832 | -0.405 | 0.279 | 0.57 |
| -1.313185729200653 | -0.403 | 0.27 | 0.562 |
| -1.306902543893473 | -0.4 | 0.26 | 0.555 |
| -1.300619358586293 | -0.397 | 0.251 | 0.547 |
| -1.294336173279114 | -0.394 | 0.242 | 0.539 |
| -1.288052987971934 | -0.391 | 0.233 | 0.531 |
| -1.281769802664754 | -0.388 | 0.225 | 0.524 |
| -1.275486617357575 | -0.385 | 0.216 | 0.516 |
| -1.269203432050395 | -0.382 | 0.208 | 0.508 |
| -1.262920246743215 | -0.379 | 0.199 | 0.5 |
| -1.256637061436036 | -0.376 | 0.191 | 0.492 |
| -1.250353876128856 | -0.373 | 0.183 | 0.484 |
| -1.244070690821677 | -0.37 | 0.175 | 0.476 |
| -1.237787505514497 | -0.367 | 0.168 | 0.468 |
| -1.231504320207317 | -0.364 | 0.16 | 0.459 |
| -1.225221134900138 | -0.361 | 0.153 | 0.451 |
| -1.218937949592958 | -0.358 | 0.146 | 0.443 |
| -1.212654764285778 | -0.354 | 0.139 | 0.435 |
| -1.206371578978599 | -0.351 | 0.132 | 0.427 |
| -1.20008839367142 | -0.348 | 0.125 | 0.419 |
| -1.193805208364239 | -0.344 | 0.118 | 0.411 |
| -1.18752202305706 | -0.341 | 0.112 | 0.403 |
| -1.18123883774988 | -0.338 | 0.106 | 0.395 |
| -1.1749556524427 | -0.335 | 0.1 | 0.387 |
| -1.168672467135521 | -0.331 | 0.094 | 0.379 |
| -1.162389281828341 | -0.328 | 0.088 | 0.371 |
| -1.156106096521162 | -0.324 | 0.082 | 0.363 |
| -1.149822911213982 | -0.321 | 0.076 | 0.355 |
| -1.143539725906802 | -0.318 | 0.071 | 0.347 |
| -1.137256540599623 | -0.314 | 0.065 | 0.339 |
| -1.130973355292443 | -0.311 | 0.06 | 0.331 |
| -1.124690169985263 | -0.307 | 0.055 | 0.323 |
| -1.118406984678084 | -0.304 | 0.05 | 0.316 |
| -1.112123799370904 | -0.301 | 0.046 | 0.308 |
| -1.105840614063724 | -0.297 | 0.041 | 0.3 |
| -1.099557428756545 | -0.294 | 0.036 | 0.293 |
| -1.093274243449365 | -0.29 | 0.032 | 0.285 |
| -1.086991058142186 | -0.287 | 0.028 | 0.278 |
| -1.080707872835006 | -0.283 | 0.024 | 0.271 |
| -1.074424687527826 | -0.28 | 0.019 | 0.263 |
| -1.068141502220647 | -0.276 | 0.016 | 0.256 |
| -1.061858316913467 | -0.273 | 0.012 | 0.249 |
| -1.055575131606287 | -0.269 | 0.008 | 0.242 |
| -1.049291946299108 | -0.266 | 0.005 | 0.235 |
| -1.043008760991928 | -0.263 | 0.001 | 0.228 |
| -1.036725575684748 | -0.259 | -0.002 | 0.221 |
| -1.030442390377569 | -0.256 | -0.005 | 0.215 |
| -1.024159205070389 | -0.252 | -0.008 | 0.208 |
| -1.01787601976321 | -0.249 | -0.011 | 0.201 |
| -1.01159283445603 | -0.245 | -0.014 | 0.195 |
| -1.00530964914885 | -0.242 | -0.017 | 0.189 |
| -0.999026463841671 | -0.239 | -0.02 | 0.182 |
| -0.992743278534491 | -0.235 | -0.022 | 0.176 |
| -0.986460093227311 | -0.232 | -0.025 | 0.17 |
| -0.980176907920132 | -0.228 | -0.027 | 0.164 |
| -0.973893722612952 | -0.225 | -0.029 | 0.158 |
| -0.967610537305772 | -0.222 | -0.031 | 0.153 |
| -0.961327351998593 | -0.218 | -0.033 | 0.147 |
| -0.955044166691413 | -0.215 | -0.035 | 0.141 |
| -0.948760981384233 | -0.212 | -0.037 | 0.136 |
| -0.942477796077054 | -0.209 | -0.039 | 0.131 |
| -0.936194610769874 | -0.205 | -0.041 | 0.125 |
| -0.929911425462695 | -0.202 | -0.042 | 0.12 |
| -0.923628240155515 | -0.199 | -0.044 | 0.115 |
| -0.917345054848335 | -0.196 | -0.045 | 0.11 |
| -0.911061869541156 | -0.192 | -0.047 | 0.105 |
| -0.904778684233976 | -0.189 | -0.048 | 0.101 |
| -0.898495498926796 | -0.186 | -0.049 | 0.096 |
| -0.892212313619617 | -0.183 | -0.05 | 0.091 |
| -0.885929128312437 | -0.18 | -0.051 | 0.087 |
| -0.879645943005257 | -0.177 | -0.052 | 0.083 |
| -0.873362757698078 | -0.174 | -0.053 | 0.079 |
| -0.867079572390898 | -0.17 | -0.054 | 0.074 |
| -0.860796387083718 | -0.167 | -0.054 | 0.07 |
| -0.854513201776539 | -0.164 | -0.055 | 0.067 |
| -0.848230016469359 | -0.161 | -0.056 | 0.063 |
| -0.84194683116218 | -0.158 | -0.056 | 0.059 |
| -0.835663645855 | -0.155 | -0.057 | 0.055 |
| -0.82938046054782 | -0.153 | -0.057 | 0.052 |
| -0.823097275240641 | -0.15 | -0.057 | 0.049 |
| -0.816814089933461 | -0.147 | -0.058 | 0.045 |
| -0.810530904626281 | -0.144 | -0.058 | 0.042 |
| -0.804247719319102 | -0.141 | -0.058 | 0.039 |
| -0.797964534011922 | -0.138 | -0.058 | 0.036 |
| -0.791681348704742 | -0.135 | -0.058 | 0.033 |
| -0.785398163397563 | -0.133 | -0.058 | 0.03 |
| -0.779114978090383 | -0.13 | -0.058 | 0.028 |
| -0.772831792783204 | -0.127 | -0.058 | 0.025 |
| -0.766548607476024 | -0.125 | -0.058 | 0.023 |
| -0.760265422168844 | -0.122 | -0.058 | 0.02 |
| -0.753982236861665 | -0.119 | -0.058 | 0.018 |
| -0.747699051554485 | -0.117 | -0.058 | 0.016 |
| -0.741415866247305 | -0.114 | -0.057 | 0.013 |
| -0.735132680940126 | -0.112 | -0.057 | 0.011 |
| -0.728849495632946 | -0.109 | -0.057 | 0.009 |
| -0.722566310325766 | -0.107 | -0.056 | 0.008 |
| -0.716283125018587 | -0.104 | -0.056 | 0.006 |
| -0.709999939711407 | -0.102 | -0.055 | 0.004 |
| -0.703716754404227 | -0.099 | -0.055 | 0.002 |
| -0.697433569097048 | -0.097 | -0.054 | 0.001 |
| -0.691150383789868 | -0.095 | -0.054 | -0.001 |
| -0.684867198482689 | -0.092 | -0.053 | -0.002 |
| -0.678584013175509 | -0.09 | -0.053 | -0.003 |
| -0.672300827868329 | -0.088 | -0.052 | -0.005 |
| -0.66601764256115 | -0.086 | -0.051 | -0.006 |
| -0.65973445725397 | -0.084 | -0.051 | -0.007 |
| -0.65345127194679 | -0.081 | -0.05 | -0.008 |
| -0.647168086639611 | -0.079 | -0.049 | -0.009 |
| -0.640884901332431 | -0.077 | -0.049 | -0.01 |
| -0.634601716025251 | -0.075 | -0.048 | -0.011 |
| -0.628318530718072 | -0.073 | -0.047 | -0.012 |
| -0.622035345410892 | -0.071 | -0.046 | -0.012 |
| -0.615752160103712 | -0.069 | -0.045 | -0.013 |
| -0.609468974796533 | -0.067 | -0.045 | -0.014 |
| -0.603185789489353 | -0.065 | -0.044 | -0.014 |
| -0.596902604182174 | -0.063 | -0.043 | -0.015 |
| -0.590619418874994 | -0.062 | -0.042 | -0.015 |
| -0.584336233567814 | -0.06 | -0.041 | -0.016 |
| -0.578053048260635 | -0.058 | -0.041 | -0.016 |
| -0.571769862953455 | -0.056 | -0.04 | -0.016 |
| -0.565486677646275 | -0.055 | -0.039 | -0.017 |
| -0.559203492339096 | -0.053 | -0.038 | -0.017 |
| -0.552920307031916 | -0.051 | -0.037 | -0.017 |
| -0.546637121724737 | -0.05 | -0.036 | -0.017 |
| -0.540353936417557 | -0.048 | -0.035 | -0.017 |
| -0.534070751110377 | -0.047 | -0.035 | -0.017 |
| -0.527787565803198 | -0.045 | -0.034 | -0.017 |
| -0.521504380496018 | -0.043 | -0.033 | -0.017 |
| -0.515221195188838 | -0.042 | -0.032 | -0.017 |
| -0.508938009881659 | -0.041 | -0.031 | -0.017 |
| -0.502654824574479 | -0.039 | -0.03 | -0.017 |
| -0.496371639267299 | -0.038 | -0.029 | -0.017 |
| -0.49008845396012 | -0.036 | -0.029 | -0.017 |
| -0.48380526865294 | -0.035 | -0.028 | -0.017 |
| -0.477522083345761 | -0.034 | -0.027 | -0.017 |
| -0.471238898038581 | -0.033 | -0.026 | -0.016 |
| -0.464955712731402 | -0.031 | -0.025 | -0.016 |
| -0.458672527424222 | -0.03 | -0.024 | -0.016 |
| -0.452389342117042 | -0.029 | -0.024 | -0.016 |
| -0.446106156809863 | -0.028 | -0.023 | -0.015 |
| -0.439822971502683 | -0.027 | -0.022 | -0.015 |
| -0.433539786195504 | -0.026 | -0.021 | -0.015 |
| -0.427256600888324 | -0.025 | -0.021 | -0.014 |
| -0.420973415581144 | -0.024 | -0.02 | -0.014 |
| -0.414690230273965 | -0.023 | -0.019 | -0.014 |
| -0.408407044966785 | -0.022 | -0.018 | -0.013 |
| -0.402123859659606 | -0.021 | -0.018 | -0.013 |
| -0.395840674352426 | -0.02 | -0.017 | -0.013 |
| -0.389557489045247 | -0.019 | -0.016 | -0.012 |
| -0.383274303738067 | -0.018 | -0.016 | -0.012 |
| -0.376991118430887 | -0.017 | -0.015 | -0.012 |
| -0.370707933123708 | -0.016 | -0.014 | -0.011 |
| -0.364424747816528 | -0.015 | -0.014 | -0.011 |
| -0.358141562509349 | -0.015 | -0.013 | -0.01 |
| -0.351858377202169 | -0.014 | -0.012 | -0.01 |
| -0.345575191894989 | -0.013 | -0.012 | -0.01 |
| -0.33929200658781 | -0.013 | -0.011 | -0.009 |
| -0.33300882128063 | -0.012 | -0.011 | -0.009 |
| -0.326725635973451 | -0.011 | -0.01 | -0.008 |
| -0.320442450666271 | -0.011 | -0.01 | -0.008 |
| -0.314159265359092 | -0.01 | -0.009 | -0.008 |
| -0.307876080051912 | -0.009 | -0.009 | -0.007 |
| -0.301592894744732 | -0.009 | -0.008 | -0.007 |
| -0.295309709437553 | -0.008 | -0.008 | -0.007 |
| -0.289026524130373 | -0.008 | -0.007 | -0.006 |
| -0.282743338823194 | -0.007 | -0.007 | -0.006 |
| -0.276460153516014 | -0.007 | -0.006 | -0.006 |
| -0.270176968208834 | -0.006 | -0.006 | -0.005 |
| -0.263893782901655 | -0.006 | -0.006 | -0.005 |
| -0.257610597594475 | -0.006 | -0.005 | -0.005 |
| -0.251327412287296 | -0.005 | -0.005 | -0.004 |
| -0.245044226980116 | -0.005 | -0.005 | -0.004 |
| -0.238761041672937 | -0.004 | -0.004 | -0.004 |
| -0.232477856365757 | -0.004 | -0.004 | -0.004 |
| -0.226194671058577 | -0.004 | -0.004 | -0.003 |
| -0.219911485751398 | -0.003 | -0.003 | -0.003 |
| -0.213628300444218 | -0.003 | -0.003 | -0.003 |
| -0.207345115137039 | -0.003 | -0.003 | -0.003 |
| -0.201061929829859 | -0.003 | -0.003 | -0.002 |
| -0.194778744522679 | -0.002 | -0.002 | -0.002 |
| -0.1884955592155 | -0.002 | -0.002 | -0.002 |
| -0.18221237390832 | -0.002 | -0.002 | -0.002 |
| -0.175929188601141 | -0.002 | -0.002 | -0.002 |
| -0.169646003293961 | -0.002 | -0.002 | -0.002 |
| -0.163362817986782 | -0.001 | -0.001 | -0.001 |
| -0.157079632679602 | -0.001 | -0.001 | -0.001 |
| -0.150796447372422 | -0.001 | -0.001 | -0.001 |
| -0.144513262065243 | -0.001 | -0.001 | -0.001 |
| -0.138230076758063 | -0.001 | -0.001 | -0.001 |
| -0.131946891450884 | -0.001 | -0.001 | -0.001 |
| -0.125663706143704 | -0.001 | -0.001 | -0.001 |
| -0.119380520836524 | -0.001 | -0.001 | -0.001 |
| -0.113097335529345 | 0 | 0 | 0 |
| -0.106814150222165 | 0 | 0 | 0 |
| -0.100530964914986 | 0 | 0 | 0 |
| -0.0942477796078061 | 0 | 0 | 0 |
| -0.0879645943006265 | 0 | 0 | 0 |
| -0.0816814089934469 | 0 | 0 | 0 |
| -0.0753982236862674 | 0 | 0 | 0 |
| -0.0691150383790878 | 0 | 0 | 0 |
| -0.0628318530719082 | 0 | 0 | 0 |
| -0.0565486677647286 | 0 | 0 | 0 |
| -0.050265482457549 | 0 | 0 | 0 |
| -0.0439822971503694 | 0 | 0 | 0 |
| -0.0376991118431899 | 0 | 0 | 0 |
| -0.0314159265360103 | 0 | 0 | 0 |
| -0.0251327412288307 | 0 | 0 | 0 |
| -0.0188495559216511 | 0 | 0 | 0 |
| -0.0125663706144715 | 0 | 0 | 0 |
| -0.00628318530729192 | 0 | 0 | 0 |
| -1.12338957580782e-13 | 0 | 0 | 0 |
| 0.00628318530706725 | 0 | 0 | 0 |
| 0.0125663706142468 | 0 | 0 | 0 |
| 0.0188495559214264 | 0 | 0 | 0 |
| 0.025132741228606 | 0 | 0 | 0 |
| 0.0314159265357856 | 0 | 0 | 0 |
| 0.0376991118429652 | 0 | 0 | 0 |
| 0.0439822971501448 | 0 | 0 | 0 |
| 0.0502654824573243 | 0 | 0 | 0 |
| 0.0565486677645039 | 0 | 0 | 0 |
| 0.0628318530716835 | 0 | 0 | 0 |
| 0.0691150383788631 | 0 | 0 | 0 |
| 0.0753982236860427 | 0 | 0 | 0 |
| 0.0816814089932222 | 0 | 0 | 0 |
| 0.0879645943004018 | 0 | 0 | 0 |
| 0.0942477796075814 | 0 | 0 | 0 |
| 0.100530964914761 | 0 | 0 | 0 |
| 0.106814150221941 | 0 | 0 | 0 |
| 0.11309733552912 | 0 | 0 | 0 |
| 0.1193805208363 | 0.001 | 0.001 | 0.001 |
| 0.125663706143479 | 0.001 | 0.001 | 0.001 |
| 0.131946891450659 | 0.001 | 0.001 | 0.001 |
| 0.138230076757839 | 0.001 | 0.001 | 0.001 |
| 0.144513262065018 | 0.001 | 0.001 | 0.001 |
| 0.150796447372198 | 0.001 | 0.001 | 0.001 |
| 0.157079632679377 | 0.001 | 0.001 | 0.001 |
| 0.163362817986557 | 0.001 | 0.001 | 0.001 |
| 0.169646003293736 | 0.002 | 0.002 | 0.002 |
| 0.175929188600916 | 0.002 | 0.002 | 0.002 |
| 0.182212373908096 | 0.002 | 0.002 | 0.002 |
| 0.188495559215275 | 0.002 | 0.002 | 0.002 |
| 0.194778744522455 | 0.002 | 0.002 | 0.002 |
| 0.201061929829634 | 0.003 | 0.003 | 0.002 |
| 0.207345115136814 | 0.003 | 0.003 | 0.003 |
| 0.213628300443994 | 0.003 | 0.003 | 0.003 |
| 0.219911485751173 | 0.003 | 0.003 | 0.003 |
| 0.226194671058353 | 0.004 | 0.004 | 0.003 |
| 0.232477856365532 | 0.004 | 0.004 | 0.004 |
| 0.238761041672712 | 0.004 | 0.004 | 0.004 |
| 0.245044226979891 | 0.005 | 0.005 | 0.004 |
| 0.251327412287071 | 0.005 | 0.005 | 0.004 |
| 0.257610597594251 | 0.006 | 0.005 | 0.005 |
| 0.26389378290143 | 0.006 | 0.006 | 0.005 |
| 0.27017696820861 | 0.006 | 0.006 | 0.005 |
| 0.276460153515789 | 0.007 | 0.006 | 0.006 |
| 0.282743338822969 | 0.007 | 0.007 | 0.006 |
| 0.289026524130149 | 0.008 | 0.007 | 0.006 |
| 0.295309709437328 | 0.008 | 0.008 | 0.007 |
| 0.301592894744508 | 0.009 | 0.008 | 0.007 |
| 0.307876080051687 | 0.009 | 0.009 | 0.007 |
| 0.314159265358867 | 0.01 | 0.009 | 0.008 |
| 0.320442450666046 | 0.011 | 0.01 | 0.008 |
| 0.326725635973226 | 0.011 | 0.01 | 0.008 |
| 0.333008821280406 | 0.012 | 0.011 | 0.009 |
| 0.339292006587585 | 0.013 | 0.011 | 0.009 |
| 0.345575191894765 | 0.013 | 0.012 | 0.01 |
| 0.351858377201944 | 0.014 | 0.012 | 0.01 |
| 0.358141562509124 | 0.015 | 0.013 | 0.01 |
| 0.364424747816304 | 0.015 | 0.014 | 0.011 |
| 0.370707933123483 | 0.016 | 0.014 | 0.011 |
| 0.376991118430663 | 0.017 | 0.015 | 0.012 |
| 0.383274303737842 | 0.018 | 0.016 | 0.012 |
| 0.389557489045022 | 0.019 | 0.016 | 0.012 |
| 0.395840674352201 | 0.02 | 0.017 | 0.013 |
| 0.402123859659381 | 0.021 | 0.018 | 0.013 |
| 0.408407044966561 | 0.022 | 0.018 | 0.013 |
| 0.41469023027374 | 0.023 | 0.019 | 0.014 |
| 0.42097341558092 | 0.024 | 0.02 | 0.014 |
| 0.427256600888099 | 0.025 | 0.021 | 0.014 |
| 0.433539786195279 | 0.026 | 0.021 | 0.015 |
| 0.439822971502459 | 0.027 | 0.022 | 0.015 |
| 0.446106156809638 | 0.028 | 0.023 | 0.015 |
| 0.452389342116818 | 0.029 | 0.024 | 0.016 |
| 0.458672527423997 | 0.03 | 0.024 | 0.016 |
| 0.464955712731177 | 0.031 | 0.025 | 0.016 |
| 0.471238898038356 | 0.033 | 0.026 | 0.016 |
| 0.477522083345536 | 0.034 | 0.027 | 0.017 |
| 0.483805268652716 | 0.035 | 0.028 | 0.017 |
| 0.490088453959895 | 0.036 | 0.029 | 0.017 |
| 0.496371639267075 | 0.038 | 0.029 | 0.017 |
| 0.502654824574254 | 0.039 | 0.03 | 0.017 |
| 0.508938009881434 | 0.041 | 0.031 | 0.017 |
| 0.515221195188614 | 0.042 | 0.032 | 0.017 |
| 0.521504380495793 | 0.043 | 0.033 | 0.017 |
| 0.527787565802973 | 0.045 | 0.034 | 0.017 |
| 0.534070751110153 | 0.047 | 0.035 | 0.017 |
| 0.540353936417332 | 0.048 | 0.035 | 0.017 |
| 0.546637121724512 | 0.05 | 0.036 | 0.017 |
| 0.552920307031692 | 0.051 | 0.037 | 0.017 |
| 0.559203492338871 | 0.053 | 0.038 | 0.017 |
| 0.565486677646051 | 0.055 | 0.039 | 0.017 |
| 0.571769862953231 | 0.056 | 0.04 | 0.016 |
| 0.57805304826041 | 0.058 | 0.041 | 0.016 |
| 0.58433623356759 | 0.06 | 0.041 | 0.016 |
| 0.590619418874769 | 0.062 | 0.042 | 0.015 |
| 0.596902604181949 | 0.063 | 0.043 | 0.015 |
| 0.603185789489129 | 0.065 | 0.044 | 0.014 |
| 0.609468974796308 | 0.067 | 0.045 | 0.014 |
| 0.615752160103488 | 0.069 | 0.045 | 0.013 |
| 0.622035345410668 | 0.071 | 0.046 | 0.012 |
| 0.628318530717847 | 0.073 | 0.047 | 0.012 |
| 0.634601716025027 | 0.075 | 0.048 | 0.011 |
| 0.640884901332206 | 0.077 | 0.049 | 0.01 |
| 0.647168086639386 | 0.079 | 0.049 | 0.009 |
| 0.653451271946566 | 0.081 | 0.05 | 0.008 |
| 0.659734457253745 | 0.084 | 0.051 | 0.007 |
| 0.666017642560925 | 0.086 | 0.051 | 0.006 |
| 0.672300827868105 | 0.088 | 0.052 | 0.005 |
| 0.678584013175284 | 0.09 | 0.053 | 0.003 |
| 0.684867198482464 | 0.092 | 0.053 | 0.002 |
| 0.691150383789644 | 0.095 | 0.054 | 0.001 |
| 0.697433569096823 | 0.097 | 0.054 | -0.001 |
| 0.703716754404003 | 0.099 | 0.055 | -0.002 |
| 0.709999939711183 | 0.102 | 0.055 | -0.004 |
| 0.716283125018362 | 0.104 | 0.056 | -0.006 |
| 0.722566310325542 | 0.107 | 0.056 | -0.008 |
| 0.728849495632721 | 0.109 | 0.057 | -0.009 |
| 0.735132680939901 | 0.112 | 0.057 | -0.011 |
| 0.741415866247081 | 0.114 | 0.057 | -0.013 |
| 0.74769905155426 | 0.117 | 0.058 | -0.016 |
| 0.75398223686144 | 0.119 | 0.058 | -0.018 |
| 0.76026542216862 | 0.122 | 0.058 | -0.02 |
| 0.766548607475799 | 0.125 | 0.058 | -0.023 |
| 0.772831792782979 | 0.127 | 0.058 | -0.025 |
| 0.779114978090159 | 0.13 | 0.058 | -0.028 |
| 0.785398163397338 | 0.133 | 0.058 | -0.03 |
| 0.791681348704518 | 0.135 | 0.058 | -0.033 |
| 0.797964534011697 | 0.138 | 0.058 | -0.036 |
| 0.804247719318877 | 0.141 | 0.058 | -0.039 |
| 0.810530904626057 | 0.144 | 0.058 | -0.042 |
| 0.816814089933236 | 0.147 | 0.058 | -0.045 |
| 0.823097275240416 | 0.15 | 0.057 | -0.049 |
| 0.829380460547596 | 0.153 | 0.057 | -0.052 |
| 0.835663645854775 | 0.155 | 0.057 | -0.055 |
| 0.841946831161955 | 0.158 | 0.056 | -0.059 |
| 0.848230016469135 | 0.161 | 0.056 | -0.063 |
| 0.854513201776314 | 0.164 | 0.055 | -0.067 |
| 0.860796387083494 | 0.167 | 0.054 | -0.07 |
| 0.867079572390674 | 0.17 | 0.054 | -0.074 |
| 0.873362757697853 | 0.174 | 0.053 | -0.079 |
| 0.879645943005033 | 0.177 | 0.052 | -0.083 |
| 0.885929128312212 | 0.18 | 0.051 | -0.087 |
| 0.892212313619392 | 0.183 | 0.05 | -0.091 |
| 0.898495498926572 | 0.186 | 0.049 | -0.096 |
| 0.904778684233751 | 0.189 | 0.048 | -0.101 |
| 0.911061869540931 | 0.192 | 0.047 | -0.105 |
| 0.917345054848111 | 0.196 | 0.045 | -0.11 |
| 0.92362824015529 | 0.199 | 0.044 | -0.115 |
| 0.92991142546247 | 0.202 | 0.042 | -0.12 |
| 0.93619461076965 | 0.205 | 0.041 | -0.125 |
| 0.942477796076829 | 0.209 | 0.039 | -0.131 |
| 0.948760981384009 | 0.212 | 0.037 | -0.136 |
| 0.955044166691188 | 0.215 | 0.035 | -0.141 |
| 0.961327351998368 | 0.218 | 0.033 | -0.147 |
| 0.967610537305548 | 0.222 | 0.031 | -0.153 |
| 0.973893722612727 | 0.225 | 0.029 | -0.158 |
| 0.980176907919907 | 0.228 | 0.027 | -0.164 |
| 0.986460093227087 | 0.232 | 0.025 | -0.17 |
| 0.992743278534266 | 0.235 | 0.022 | -0.176 |
| 0.999026463841446 | 0.239 | 0.02 | -0.182 |
| 1.005309649148626 | 0.242 | 0.017 | -0.189 |
| 1.011592834455805 | 0.245 | 0.014 | -0.195 |
| 1.017876019762985 | 0.249 | 0.011 | -0.201 |
| 1.024159205070164 | 0.252 | 0.008 | -0.208 |
| 1.030442390377344 | 0.256 | 0.005 | -0.215 |
| 1.036725575684524 | 0.259 | 0.002 | -0.221 |
| 1.043008760991703 | 0.263 | -0.001 | -0.228 |
| 1.049291946298883 | 0.266 | -0.005 | -0.235 |
| 1.055575131606063 | 0.269 | -0.008 | -0.242 |
| 1.061858316913242 | 0.273 | -0.012 | -0.249 |
| 1.068141502220422 | 0.276 | -0.016 | -0.256 |
| 1.074424687527602 | 0.28 | -0.019 | -0.263 |
| 1.080707872834781 | 0.283 | -0.024 | -0.271 |
| 1.086991058141961 | 0.287 | -0.028 | -0.278 |
| 1.09327424344914 | 0.29 | -0.032 | -0.285 |
| 1.09955742875632 | 0.294 | -0.036 | -0.293 |
| 1.1058406140635 | 0.297 | -0.041 | -0.3 |
| 1.112123799370679 | 0.301 | -0.046 | -0.308 |
| 1.11840698467786 | 0.304 | -0.05 | -0.316 |
| 1.124690169985039 | 0.307 | -0.055 | -0.323 |
| 1.130973355292218 | 0.311 | -0.06 | -0.331 |
| 1.137256540599398 | 0.314 | -0.065 | -0.339 |
| 1.143539725906578 | 0.318 | -0.071 | -0.347 |
| 1.149822911213757 | 0.321 | -0.076 | -0.355 |
| 1.156106096520937 | 0.324 | -0.082 | -0.363 |
| 1.162389281828116 | 0.328 | -0.088 | -0.371 |
| 1.168672467135296 | 0.331 | -0.094 | -0.379 |
| 1.174955652442476 | 0.335 | -0.1 | -0.387 |
| 1.181238837749655 | 0.338 | -0.106 | -0.395 |
| 1.187522023056835 | 0.341 | -0.112 | -0.403 |
| 1.193805208364015 | 0.344 | -0.118 | -0.411 |
| 1.200088393671194 | 0.348 | -0.125 | -0.419 |
| 1.206371578978374 | 0.351 | -0.132 | -0.427 |
| 1.212654764285554 | 0.354 | -0.139 | -0.435 |
| 1.218937949592733 | 0.358 | -0.146 | -0.443 |
| 1.225221134899913 | 0.361 | -0.153 | -0.451 |
| 1.231504320207093 | 0.364 | -0.16 | -0.459 |
| 1.237787505514272 | 0.367 | -0.168 | -0.468 |
| 1.244070690821452 | 0.37 | -0.175 | -0.476 |
| 1.250353876128631 | 0.373 | -0.183 | -0.484 |
| 1.256637061435811 | 0.376 | -0.191 | -0.492 |
| 1.262920246742991 | 0.379 | -0.199 | -0.5 |
| 1.26920343205017 | 0.382 | -0.208 | -0.508 |
| 1.27548661735735 | 0.385 | -0.216 | -0.516 |
| 1.28176980266453 | 0.388 | -0.225 | -0.524 |
| 1.28805298797171 | 0.391 | -0.233 | -0.531 |
| 1.294336173278889 | 0.394 | -0.242 | -0.539 |
| 1.300619358586069 | 0.397 | -0.251 | -0.547 |
| 1.306902543893248 | 0.4 | -0.26 | -0.555 |
| 1.313185729200428 | 0.403 | -0.27 | -0.562 |
| 1.319468914507607 | 0.405 | -0.279 | -0.57 |
| 1.325752099814787 | 0.408 | -0.289 | -0.577 |
| 1.332035285121967 | 0.411 | -0.299 | -0.585 |
| 1.338318470429146 | 0.413 | -0.309 | -0.592 |
| 1.344601655736326 | 0.416 | -0.319 | -0.599 |
| 1.350884841043506 | 0.418 | -0.329 | -0.606 |
| 1.357168026350685 | 0.421 | -0.34 | -0.613 |
| 1.363451211657865 | 0.423 | -0.35 | -0.62 |
| 1.369734396965045 | 0.426 | -0.361 | -0.627 |
| 1.376017582272224 | 0.428 | -0.372 | -0.633 |
| 1.382300767579404 | 0.43 | -0.383 | -0.64 |
| 1.388583952886583 | 0.433 | -0.394 | -0.646 |
| 1.394867138193763 | 0.435 | -0.406 | -0.652 |
| 1.401150323500943 | 0.437 | -0.417 | -0.658 |
| 1.407433508808122 | 0.439 | -0.429 | -0.664 |
| 1.413716694115302 | 0.441 | -0.441 | -0.67 |
| 1.419999879422482 | 0.443 | -0.453 | -0.676 |
| 1.426283064729661 | 0.445 | -0.465 | -0.681 |
| 1.432566250036841 | 0.447 | -0.477 | -0.687 |
| 1.438849435344021 | 0.448 | -0.49 | -0.692 |
| 1.4451326206512 | 0.45 | -0.502 | -0.697 |
| 1.45141580595838 | 0.452 | -0.515 | -0.701 |
| 1.45769899126556 | 0.453 | -0.528 | -0.706 |
| 1.46398217657274 | 0.455 | -0.541 | -0.71 |
| 1.470265361879919 | 0.456 | -0.554 | -0.714 |
| 1.476548547187098 | 0.457 | -0.568 | -0.718 |
| 1.482831732494278 | 0.459 | -0.581 | -0.722 |
| 1.489114917801458 | 0.46 | -0.595 | -0.725 |
| 1.495398103108637 | 0.461 | -0.609 | -0.729 |
| 1.501681288415817 | 0.462 | -0.623 | -0.732 |
| 1.507964473722997 | 0.463 | -0.637 | -0.735 |
| 1.514247659030176 | 0.464 | -0.651 | -0.737 |
| 1.520530844337356 | 0.464 | -0.665 | -0.739 |
| 1.526814029644536 | 0.465 | -0.68 | -0.742 |
| 1.533097214951715 | 0.466 | -0.695 | -0.743 |
| 1.539380400258895 | 0.466 | -0.709 | -0.745 |
| 1.545663585566075 | 0.467 | -0.724 | -0.746 |
| 1.551946770873254 | 0.467 | -0.739 | -0.747 |
| 1.558229956180434 | 0.467 | -0.755 | -0.748 |
| 1.564513141487613 | 0.467 | -0.77 | -0.748 |
| 1.570796326794793 | 0.467 | -0.785 | -0.748 |
| 1.577079512101973 | 0.467 | -0.801 | -0.748 |
| 1.583362697409152 | 0.467 | -0.817 | -0.748 |
| 1.589645882716332 | 0.467 | -0.832 | -0.747 |
| 1.595929068023512 | 0.467 | -0.848 | -0.746 |
| 1.602212253330691 | 0.466 | -0.864 | -0.745 |
| 1.608495438637871 | 0.466 | -0.881 | -0.743 |
| 1.61477862394505 | 0.465 | -0.897 | -0.741 |
| 1.62106180925223 | 0.464 | -0.913 | -0.739 |
| 1.62734499455941 | 0.463 | -0.93 | -0.736 |
| 1.633628179866589 | 0.462 | -0.946 | -0.733 |
| 1.63991136517377 | 0.461 | -0.963 | -0.73 |
| 1.646194550480949 | 0.46 | -0.98 | -0.726 |
| 1.652477735788128 | 0.459 | -0.997 | -0.722 |
| 1.658760921095308 | 0.457 | -1.014 | -0.718 |
| 1.665044106402488 | 0.456 | -1.031 | -0.713 |
| 1.671327291709667 | 0.454 | -1.048 | -0.708 |
| 1.677610477016847 | 0.452 | -1.065 | -0.703 |
| 1.683893662324026 | 0.45 | -1.082 | -0.697 |
| 1.690176847631206 | 0.448 | -1.1 | -0.691 |
| 1.696460032938386 | 0.446 | -1.117 | -0.684 |
| 1.702743218245565 | 0.443 | -1.135 | -0.677 |
| 1.709026403552745 | 0.441 | -1.152 | -0.67 |
| 1.715309588859925 | 0.438 | -1.17 | -0.663 |
| 1.721592774167104 | 0.436 | -1.188 | -0.655 |
| 1.727875959474284 | 0.433 | -1.206 | -0.646 |
| 1.734159144781464 | 0.43 | -1.224 | -0.638 |
| 1.740442330088643 | 0.427 | -1.241 | -0.629 |
| 1.746725515395823 | 0.423 | -1.259 | -0.619 |
| 1.753008700703003 | 0.42 | -1.277 | -0.609 |
| 1.759291886010182 | 0.416 | -1.296 | -0.599 |
| 1.765575071317362 | 0.413 | -1.314 | -0.588 |
| 1.771858256624541 | 0.409 | -1.332 | -0.577 |
| 1.778141441931721 | 0.405 | -1.35 | -0.566 |
| 1.784424627238901 | 0.401 | -1.368 | -0.554 |
| 1.79070781254608 | 0.396 | -1.386 | -0.542 |
| 1.79699099785326 | 0.392 | -1.405 | -0.53 |
| 1.80327418316044 | 0.387 | -1.423 | -0.517 |
| 1.809557368467619 | 0.382 | -1.441 | -0.503 |
| 1.815840553774799 | 0.377 | -1.459 | -0.49 |
| 1.822123739081979 | 0.372 | -1.478 | -0.476 |
| 1.828406924389158 | 0.367 | -1.496 | -0.461 |
| 1.834690109696338 | 0.362 | -1.514 | -0.446 |
| 1.840973295003518 | 0.356 | -1.532 | -0.431 |
| 1.847256480310697 | 0.35 | -1.551 | -0.415 |
| 1.853539665617877 | 0.344 | -1.569 | -0.399 |
| 1.859822850925056 | 0.338 | -1.587 | -0.383 |
| 1.866106036232236 | 0.332 | -1.605 | -0.366 |
| 1.872389221539416 | 0.326 | -1.624 | -0.349 |
| 1.878672406846595 | 0.319 | -1.642 | -0.332 |
| 1.884955592153775 | 0.312 | -1.66 | -0.314 |
| 1.891238777460955 | 0.305 | -1.678 | -0.295 |
| 1.897521962768134 | 0.298 | -1.696 | -0.277 |
| 1.903805148075314 | 0.291 | -1.714 | -0.258 |
| 1.910088333382494 | 0.283 | -1.732 | -0.239 |
| 1.916371518689673 | 0.275 | -1.749 | -0.219 |
| 1.922654703996853 | 0.267 | -1.767 | -0.199 |
| 1.928937889304033 | 0.259 | -1.785 | -0.178 |
| 1.935221074611212 | 0.251 | -1.802 | -0.158 |
| 1.941504259918392 | 0.243 | -1.82 | -0.137 |
| 1.947787445225571 | 0.234 | -1.837 | -0.115 |
| 1.954070630532751 | 0.225 | -1.855 | -0.094 |
| 1.960353815839931 | 0.216 | -1.872 | -0.071 |
| 1.96663700114711 | 0.207 | -1.889 | -0.049 |
| 1.97292018645429 | 0.197 | -1.906 | -0.026 |
| 1.97920337176147 | 0.187 | -1.923 | -0.003 |
| 1.985486557068649 | 0.178 | -1.94 | 0.02 |
| 1.991769742375829 | 0.168 | -1.956 | 0.044 |
| 1.998052927683009 | 0.157 | -1.973 | 0.067 |
| 2.004336112990188 | 0.147 | -1.989 | 0.092 |
| 2.010619298297368 | 0.136 | -2.006 | 0.116 |
| 2.016902483604547 | 0.125 | -2.022 | 0.141 |
| 2.023185668911727 | 0.114 | -2.038 | 0.166 |
| 2.029468854218907 | 0.103 | -2.054 | 0.191 |
| 2.035752039526086 | 0.091 | -2.069 | 0.217 |
| 2.042035224833266 | 0.079 | -2.085 | 0.242 |
| 2.048318410140446 | 0.067 | -2.1 | 0.268 |
| 2.054601595447625 | 0.055 | -2.115 | 0.295 |
| 2.060884780754805 | 0.043 | -2.13 | 0.321 |
| 2.067167966061984 | 0.03 | -2.145 | 0.348 |
| 2.073451151369164 | 0.017 | -2.159 | 0.375 |
| 2.079734336676344 | 0.004 | -2.174 | 0.402 |
| 2.086017521983524 | -0.009 | -2.188 | 0.429 |
| 2.092300707290703 | -0.023 | -2.202 | 0.456 |
| 2.098583892597883 | -0.037 | -2.216 | 0.484 |
| 2.104867077905062 | -0.051 | -2.229 | 0.512 |
| 2.111150263212242 | -0.065 | -2.242 | 0.539 |
| 2.117433448519422 | -0.08 | -2.256 | 0.568 |
| 2.123716633826601 | -0.095 | -2.268 | 0.596 |
| 2.129999819133781 | -0.11 | -2.281 | 0.624 |
| 2.136283004440961 | -0.125 | -2.293 | 0.652 |
| 2.14256618974814 | -0.14 | -2.305 | 0.681 |
| 2.14884937505532 | -0.156 | -2.317 | 0.709 |
| 2.1551325603625 | -0.172 | -2.329 | 0.738 |
| 2.16141574566968 | -0.188 | -2.34 | 0.767 |
| 2.167698930976859 | -0.205 | -2.351 | 0.796 |
| 2.173982116284038 | -0.221 | -2.362 | 0.824 |
| 2.180265301591218 | -0.238 | -2.372 | 0.853 |
| 2.186548486898398 | -0.256 | -2.382 | 0.882 |
| 2.192831672205577 | -0.273 | -2.392 | 0.911 |
| 2.199114857512757 | -0.291 | -2.402 | 0.94 |
| 2.205398042819936 | -0.309 | -2.411 | 0.969 |
| 2.211681228127116 | -0.327 | -2.42 | 0.998 |
| 2.217964413434296 | -0.345 | -2.428 | 1.027 |
| 2.224247598741475 | -0.364 | -2.437 | 1.055 |
| 2.230530784048655 | -0.383 | -2.445 | 1.084 |
| 2.236813969355835 | -0.403 | -2.452 | 1.113 |
| 2.243097154663014 | -0.422 | -2.46 | 1.141 |
| 2.249380339970194 | -0.442 | -2.466 | 1.17 |
| 2.255663525277374 | -0.462 | -2.473 | 1.198 |
| 2.261946710584553 | -0.482 | -2.479 | 1.226 |
| 2.268229895891733 | -0.503 | -2.485 | 1.255 |
| 2.274513081198912 | -0.524 | -2.491 | 1.282 |
| 2.280796266506092 | -0.545 | -2.496 | 1.31 |
| 2.287079451813272 | -0.567 | -2.5 | 1.338 |
| 2.293362637120452 | -0.588 | -2.505 | 1.365 |
| 2.299645822427631 | -0.61 | -2.509 | 1.393 |
| 2.305929007734811 | -0.633 | -2.512 | 1.42 |
| 2.312212193041991 | -0.655 | -2.515 | 1.446 |
| 2.31849537834917 | -0.678 | -2.518 | 1.473 |
| 2.32477856365635 | -0.701 | -2.52 | 1.499 |
| 2.331061748963529 | -0.724 | -2.522 | 1.525 |
| 2.337344934270709 | -0.748 | -2.524 | 1.551 |
| 2.343628119577889 | -0.772 | -2.525 | 1.576 |
| 2.349911304885068 | -0.796 | -2.526 | 1.602 |
| 2.356194490192248 | -0.821 | -2.526 | 1.626 |
| 2.362477675499428 | -0.846 | -2.526 | 1.651 |
| 2.368760860806607 | -0.871 | -2.525 | 1.675 |
| 2.375044046113787 | -0.896 | -2.524 | 1.699 |
| 2.381327231420966 | -0.922 | -2.522 | 1.722 |
| 2.387610416728146 | -0.948 | -2.52 | 1.745 |
| 2.393893602035326 | -0.974 | -2.518 | 1.768 |
| 2.400176787342505 | -1 | -2.515 | 1.79 |
| 2.406459972649685 | -1.027 | -2.511 | 1.812 |
| 2.412743157956865 | -1.054 | -2.508 | 1.833 |
| 2.419026343264044 | -1.082 | -2.503 | 1.854 |
| 2.425309528571224 | -1.11 | -2.498 | 1.875 |
| 2.431592713878404 | -1.138 | -2.493 | 1.895 |
| 2.437875899185583 | -1.166 | -2.487 | 1.914 |
| 2.444159084492763 | -1.195 | -2.481 | 1.933 |
| 2.450442269799943 | -1.224 | -2.474 | 1.951 |
| 2.456725455107122 | -1.253 | -2.467 | 1.969 |
| 2.463008640414302 | -1.282 | -2.459 | 1.987 |
| 2.469291825721482 | -1.312 | -2.451 | 2.003 |
| 2.475575011028661 | -1.342 | -2.442 | 2.02 |
| 2.481858196335841 | -1.373 | -2.432 | 2.035 |
| 2.48814138164302 | -1.403 | -2.422 | 2.05 |
| 2.4944245669502 | -1.434 | -2.412 | 2.065 |
| 2.50070775225738 | -1.466 | -2.401 | 2.079 |
| 2.506990937564559 | -1.497 | -2.39 | 2.092 |
| 2.51327412287174 | -1.529 | -2.378 | 2.105 |
| 2.519557308178919 | -1.562 | -2.365 | 2.117 |
| 2.525840493486098 | -1.594 | -2.352 | 2.128 |
| 2.532123678793278 | -1.627 | -2.338 | 2.138 |
| 2.538406864100458 | -1.66 | -2.324 | 2.148 |
| 2.544690049407637 | -1.694 | -2.31 | 2.158 |
| 2.550973234714817 | -1.728 | -2.294 | 2.166 |
| 2.557256420021996 | -1.762 | -2.278 | 2.174 |
| 2.563539605329176 | -1.796 | -2.262 | 2.181 |
| 2.569822790636356 | -1.831 | -2.245 | 2.187 |
| 2.576105975943535 | -1.866 | -2.228 | 2.193 |
| 2.582389161250715 | -1.901 | -2.21 | 2.198 |
| 2.588672346557895 | -1.937 | -2.191 | 2.202 |
| 2.594955531865074 | -1.973 | -2.172 | 2.205 |
| 2.601238717172254 | -2.009 | -2.152 | 2.208 |
| 2.607521902479433 | -2.046 | -2.132 | 2.209 |
| 2.613805087786613 | -2.083 | -2.111 | 2.21 |
| 2.620088273093793 | -2.12 | -2.09 | 2.211 |
| 2.626371458400972 | -2.158 | -2.068 | 2.21 |
| 2.632654643708152 | -2.195 | -2.045 | 2.208 |
| 2.638937829015332 | -2.234 | -2.022 | 2.206 |
| 2.645221014322511 | -2.272 | -1.998 | 2.203 |
| 2.651504199629691 | -2.311 | -1.974 | 2.199 |
| 2.657787384936871 | -2.35 | -1.949 | 2.194 |
| 2.66407057024405 | -2.39 | -1.923 | 2.188 |
| 2.67035375555123 | -2.429 | -1.897 | 2.182 |
| 2.67663694085841 | -2.469 | -1.871 | 2.174 |
| 2.682920126165589 | -2.51 | -1.844 | 2.166 |
| 2.689203311472769 | -2.55 | -1.816 | 2.157 |
| 2.695486496779948 | -2.591 | -1.787 | 2.147 |
| 2.701769682087128 | -2.633 | -1.758 | 2.136 |
| 2.708052867394308 | -2.674 | -1.729 | 2.124 |
| 2.714336052701487 | -2.716 | -1.699 | 2.111 |
| 2.720619238008667 | -2.759 | -1.668 | 2.097 |
| 2.726902423315847 | -2.801 | -1.637 | 2.083 |
| 2.733185608623026 | -2.844 | -1.605 | 2.067 |
| 2.739468793930206 | -2.888 | -1.573 | 2.051 |
| 2.745751979237386 | -2.931 | -1.54 | 2.034 |
| 2.752035164544565 | -2.975 | -1.506 | 2.016 |
| 2.758318349851745 | -3.019 | -1.472 | 1.997 |
| 2.764601535158925 | -3.064 | -1.437 | 1.977 |
| 2.770884720466104 | -3.108 | -1.402 | 1.956 |
| 2.777167905773284 | -3.154 | -1.366 | 1.934 |
| 2.783451091080463 | -3.199 | -1.33 | 1.911 |
| 2.789734276387643 | -3.245 | -1.293 | 1.888 |
| 2.796017461694823 | -3.291 | -1.255 | 1.863 |
| 2.802300647002002 | -3.337 | -1.217 | 1.838 |
| 2.808583832309182 | -3.384 | -1.178 | 1.811 |
| 2.814867017616362 | -3.431 | -1.139 | 1.784 |
| 2.821150202923541 | -3.478 | -1.099 | 1.756 |
| 2.827433388230721 | -3.526 | -1.059 | 1.727 |
| 2.833716573537901 | -3.574 | -1.018 | 1.697 |
| 2.83999975884508 | -3.622 | -0.976 | 1.666 |
| 2.84628294415226 | -3.67 | -0.934 | 1.634 |
| 2.852566129459439 | -3.719 | -0.892 | 1.601 |
| 2.858849314766619 | -3.768 | -0.849 | 1.568 |
| 2.865132500073799 | -3.818 | -0.805 | 1.533 |
| 2.871415685380978 | -3.868 | -0.761 | 1.498 |
| 2.877698870688158 | -3.918 | -0.716 | 1.462 |
| 2.883982055995337 | -3.968 | -0.671 | 1.425 |
| 2.890265241302517 | -4.019 | -0.625 | 1.387 |
| 2.896548426609697 | -4.07 | -0.579 | 1.349 |
| 2.902831611916877 | -4.121 | -0.532 | 1.309 |
| 2.909114797224056 | -4.173 | -0.485 | 1.269 |
| 2.915397982531236 | -4.225 | -0.437 | 1.228 |
| 2.921681167838416 | -4.277 | -0.389 | 1.186 |
| 2.927964353145595 | -4.329 | -0.34 | 1.143 |
| 2.934247538452775 | -4.382 | -0.291 | 1.099 |
| 2.940530723759954 | -4.435 | -0.241 | 1.055 |
| 2.946813909067134 | -4.489 | -0.191 | 1.01 |
| 2.953097094374314 | -4.542 | -0.14 | 0.964 |
| 2.959380279681493 | -4.596 | -0.089 | 0.917 |
| 2.965663464988673 | -4.65 | -0.037 | 0.87 |
| 2.971946650295853 | -4.705 | 0.015 | 0.822 |
| 2.978229835603032 | -4.76 | 0.067 | 0.773 |
| 2.984513020910212 | -4.815 | 0.12 | 0.723 |
| 2.990796206217391 | -4.87 | 0.174 | 0.673 |
| 2.997079391524571 | -4.926 | 0.228 | 0.622 |
| 3.003362576831751 | -4.982 | 0.282 | 0.571 |
| 3.009645762138931 | -5.038 | 0.337 | 0.519 |
| 3.01592894744611 | -5.095 | 0.392 | 0.466 |
| 3.02221213275329 | -5.152 | 0.447 | 0.412 |
| 3.028495318060469 | -5.209 | 0.503 | 0.358 |
| 3.034778503367649 | -5.266 | 0.56 | 0.304 |
| 3.041061688674829 | -5.324 | 0.616 | 0.248 |
| 3.047344873982008 | -5.382 | 0.673 | 0.193 |
| 3.053628059289188 | -5.44 | 0.731 | 0.136 |
| 3.059911244596367 | -5.499 | 0.789 | 0.08 |
| 3.066194429903547 | -5.557 | 0.847 | 0.022 |
| 3.072477615210727 | -5.616 | 0.906 | -0.036 |
| 3.078760800517906 | -5.676 | 0.965 | -0.094 |
| 3.085043985825086 | -5.735 | 1.024 | -0.153 |
| 3.091327171132266 | -5.795 | 1.083 | -0.212 |
| 3.097610356439445 | -5.855 | 1.143 | -0.271 |
| 3.103893541746625 | -5.916 | 1.204 | -0.331 |
| 3.110176727053805 | -5.976 | 1.264 | -0.392 |
| 3.116459912360984 | -6.037 | 1.325 | -0.452 |
| 3.122743097668164 | -6.098 | 1.386 | -0.513 |
| 3.129026282975343 | -6.16 | 1.447 | -0.575 |
| 3.135309468282523 | -6.221 | 1.509 | -0.636 |
| 3.141592653589703 | -6.283 | 1.571 | -0.698 |
| 3.147875838896883 | -6.345 | 1.633 | -0.76 |
| 3.154159024204062 | -6.408 | 1.695 | -0.823 |
| 3.160442209511242 | -6.47 | 1.758 | -0.885 |
| 3.166725394818422 | -6.533 | 1.821 | -0.948 |
| 3.173008580125601 | -6.596 | 1.884 | -1.011 |
| 3.179291765432781 | -6.66 | 1.947 | -1.074 |
| 3.18557495073996 | -6.723 | 2.01 | -1.137 |
| 3.19185813604714 | -6.787 | 2.074 | -1.2 |
| 3.19814132135432 | -6.851 | 2.138 | -1.264 |
| 3.2044245066615 | -6.915 | 2.202 | -1.327 |
| 3.210707691968679 | -6.98 | 2.266 | -1.39 |
| 3.216990877275859 | -7.045 | 2.33 | -1.454 |
| 3.223274062583038 | -7.11 | 2.394 | -1.517 |
| 3.229557247890217 | -7.175 | 2.459 | -1.58 |
| 3.235840433197398 | -7.24 | 2.523 | -1.644 |
| 3.242123618504577 | -7.306 | 2.588 | -1.707 |
| 3.248406803811757 | -7.372 | 2.653 | -1.77 |
| 3.254689989118936 | -7.438 | 2.718 | -1.833 |
| 3.260973174426116 | -7.504 | 2.783 | -1.895 |
| 3.267256359733296 | -7.57 | 2.848 | -1.958 |
| 3.273539545040475 | -7.637 | 2.912 | -2.02 |
| 3.279822730347655 | -7.704 | 2.978 | -2.082 |
| 3.286105915654835 | -7.771 | 3.043 | -2.144 |
| 3.292389100962014 | -7.838 | 3.108 | -2.205 |
| 3.298672286269194 | -7.905 | 3.173 | -2.266 |
| 3.304955471576374 | -7.973 | 3.238 | -2.327 |
| 3.311238656883553 | -8.041 | 3.303 | -2.387 |
| 3.317521842190732 | -8.109 | 3.368 | -2.447 |
| 3.323805027497912 | -8.177 | 3.432 | -2.507 |
| 3.330088212805092 | -8.245 | 3.497 | -2.566 |
| 3.336371398112272 | -8.314 | 3.562 | -2.624 |
| 3.342654583419451 | -8.383 | 3.627 | -2.682 |
| 3.34893776872663 | -8.452 | 3.691 | -2.74 |
| 3.355220954033811 | -8.521 | 3.756 | -2.797 |
| 3.36150413934099 | -8.59 | 3.82 | -2.853 |
| 3.36778732464817 | -8.659 | 3.884 | -2.909 |
| 3.37407050995535 | -8.729 | 3.948 | -2.964 |
| 3.380353695262529 | -8.798 | 4.012 | -3.019 |
| 3.386636880569709 | -8.868 | 4.076 | -3.073 |
| 3.392920065876888 | -8.938 | 4.139 | -3.126 |
| 3.399203251184068 | -9.008 | 4.202 | -3.178 |
| 3.405486436491248 | -9.079 | 4.265 | -3.23 |
| 3.411769621798427 | -9.149 | 4.328 | -3.28 |
| 3.418052807105607 | -9.22 | 4.391 | -3.33 |
| 3.424335992412787 | -9.29 | 4.453 | -3.38 |
| 3.430619177719966 | -9.361 | 4.515 | -3.428 |
| 3.436902363027146 | -9.432 | 4.577 | -3.475 |
| 3.443185548334325 | -9.503 | 4.639 | -3.522 |
| 3.449468733641505 | -9.574 | 4.7 | -3.567 |
| 3.455751918948685 | -9.646 | 4.761 | -3.612 |
| 3.462035104255865 | -9.717 | 4.821 | -3.656 |
| 3.468318289563044 | -9.788 | 4.881 | -3.698 |
| 3.474601474870224 | -9.86 | 4.941 | -3.74 |
| 3.480884660177403 | -9.932 | 5.001 | -3.78 |
| 3.487167845484583 | -10.004 | 5.06 | -3.82 |
| 3.493451030791763 | -10.076 | 5.118 | -3.858 |
| 3.499734216098942 | -10.148 | 5.177 | -3.895 |
| 3.506017401406122 | -10.22 | 5.234 | -3.931 |
| 3.512300586713302 | -10.292 | 5.292 | -3.966 |
| 3.518583772020481 | -10.364 | 5.349 | -4 |
| 3.524866957327661 | -10.437 | 5.405 | -4.032 |
| 3.531150142634841 | -10.509 | 5.461 | -4.064 |
| 3.53743332794202 | -10.582 | 5.517 | -4.094 |
| 3.5437165132492 | -10.654 | 5.572 | -4.123 |
| 3.54999969855638 | -10.727 | 5.626 | -4.15 |
| 3.556282883863559 | -10.8 | 5.68 | -4.176 |
| 3.562566069170739 | -10.872 | 5.734 | -4.201 |
| 3.568849254477918 | -10.945 | 5.786 | -4.225 |
| 3.575132439785098 | -11.018 | 5.839 | -4.247 |
| 3.581415625092278 | -11.091 | 5.89 | -4.267 |
| 3.587698810399457 | -11.164 | 5.941 | -4.287 |
| 3.593981995706637 | -11.237 | 5.992 | -4.305 |
| 3.600265181013817 | -11.31 | 6.042 | -4.321 |
| 3.606548366320996 | -11.383 | 6.091 | -4.336 |
| 3.612831551628176 | -11.456 | 6.139 | -4.35 |
| 3.619114736935355 | -11.529 | 6.187 | -4.362 |
| 3.625397922242535 | -11.602 | 6.234 | -4.372 |
| 3.631681107549715 | -11.675 | 6.281 | -4.381 |
| 3.637964292856894 | -11.748 | 6.327 | -4.389 |
| 3.644247478164074 | -11.821 | 6.372 | -4.395 |
| 3.650530663471254 | -11.895 | 6.416 | -4.399 |
| 3.656813848778433 | -11.968 | 6.46 | -4.402 |
| 3.663097034085613 | -12.041 | 6.503 | -4.404 |
| 3.669380219392792 | -12.114 | 6.545 | -4.403 |
| 3.675663404699972 | -12.187 | 6.586 | -4.402 |
| 3.681946590007152 | -12.26 | 6.626 | -4.398 |
| 3.688229775314331 | -12.333 | 6.666 | -4.393 |
| 3.694512960621511 | -12.406 | 6.705 | -4.386 |
| 3.700796145928691 | -12.479 | 6.743 | -4.378 |
| 3.70707933123587 | -12.552 | 6.78 | -4.368 |
| 3.71336251654305 | -12.625 | 6.817 | -4.356 |
| 3.71964570185023 | -12.698 | 6.852 | -4.343 |
| 3.72592888715741 | -12.77 | 6.887 | -4.328 |
| 3.732212072464589 | -12.843 | 6.92 | -4.311 |
| 3.738495257771769 | -12.916 | 6.953 | -4.293 |
| 3.744778443078948 | -12.988 | 6.985 | -4.273 |
| 3.751061628386128 | -13.061 | 7.016 | -4.251 |
| 3.757344813693308 | -13.133 | 7.046 | -4.228 |
| 3.763627999000487 | -13.206 | 7.075 | -4.203 |
| 3.769911184307667 | -13.278 | 7.103 | -4.176 |
| 3.776194369614846 | -13.35 | 7.13 | -4.148 |
| 3.782477554922026 | -13.422 | 7.156 | -4.118 |
| 3.788760740229206 | -13.494 | 7.181 | -4.086 |
| 3.795043925536385 | -13.566 | 7.205 | -4.052 |
| 3.801327110843565 | -13.638 | 7.229 | -4.017 |
| 3.807610296150745 | -13.71 | 7.251 | -3.98 |
| 3.813893481457924 | -13.781 | 7.272 | -3.942 |
| 3.820176666765104 | -13.853 | 7.292 | -3.901 |
| 3.826459852072284 | -13.924 | 7.311 | -3.859 |
| 3.832743037379463 | -13.995 | 7.328 | -3.816 |
| 3.839026222686643 | -14.066 | 7.345 | -3.77 |
| 3.845309407993823 | -14.137 | 7.361 | -3.723 |
| 3.851592593301002 | -14.208 | 7.375 | -3.675 |
| 3.857875778608182 | -14.279 | 7.389 | -3.625 |
| 3.864158963915361 | -14.349 | 7.401 | -3.573 |
| 3.870442149222541 | -14.419 | 7.412 | -3.519 |
| 3.876725334529721 | -14.489 | 7.422 | -3.464 |
| 3.8830085198369 | -14.559 | 7.431 | -3.407 |
| 3.88929170514408 | -14.629 | 7.439 | -3.349 |
| 3.89557489045126 | -14.699 | 7.446 | -3.289 |
| 3.901858075758439 | -14.768 | 7.451 | -3.227 |
| 3.908141261065619 | -14.837 | 7.455 | -3.164 |
| 3.914424446372799 | -14.906 | 7.458 | -3.099 |
| 3.920707631679978 | -14.975 | 7.46 | -3.033 |
| 3.926990816987158 | -15.044 | 7.461 | -2.965 |
| 3.933274002294337 | -15.112 | 7.46 | -2.896 |
| 3.939557187601517 | -15.18 | 7.458 | -2.825 |
| 3.945840372908697 | -15.248 | 7.455 | -2.753 |
| 3.952123558215876 | -15.316 | 7.451 | -2.679 |
| 3.958406743523056 | -15.384 | 7.445 | -2.604 |
| 3.964689928830236 | -15.451 | 7.438 | -2.528 |
| 3.970973114137415 | -15.518 | 7.43 | -2.45 |
| 3.977256299444595 | -15.585 | 7.421 | -2.37 |
| 3.983539484751775 | -15.651 | 7.41 | -2.29 |
| 3.989822670058954 | -15.718 | 7.399 | -2.208 |
| 3.996105855366134 | -15.784 | 7.385 | -2.124 |
| 4.002389040673314 | -15.849 | 7.371 | -2.04 |
| 4.008672225980493 | -15.915 | 7.355 | -1.954 |
| 4.014955411287672 | -15.98 | 7.338 | -1.866 |
| 4.021238596594851 | -16.045 | 7.32 | -1.778 |
| 4.02752178190203 | -16.11 | 7.3 | -1.688 |
| 4.03380496720921 | -16.174 | 7.279 | -1.598 |
| 4.040088152516389 | -16.238 | 7.257 | -1.506 |
| 4.046371337823567 | -16.302 | 7.233 | -1.412 |
| 4.052654523130747 | -16.365 | 7.208 | -1.318 |
| 4.058937708437926 | -16.428 | 7.182 | -1.223 |
| 4.065220893745105 | -16.491 | 7.154 | -1.127 |
| 4.071504079052285 | -16.553 | 7.125 | -1.03 |
| 4.077787264359464 | -16.615 | 7.095 | -0.931 |
| 4.084070449666643 | -16.677 | 7.063 | -0.832 |
| 4.090353634973822 | -16.739 | 7.03 | -0.732 |
| 4.096636820281001 | -16.8 | 6.995 | -0.631 |
| 4.102920005588181 | -16.86 | 6.96 | -0.529 |
| 4.10920319089536 | -16.921 | 6.922 | -0.426 |
| 4.115486376202539 | -16.981 | 6.884 | -0.323 |
| 4.121769561509718 | -17.04 | 6.844 | -0.219 |
| 4.128052746816897 | -17.1 | 6.803 | -0.114 |
| 4.134335932124077 | -17.159 | 6.76 | -0.008 |
| 4.140619117431256 | -17.217 | 6.716 | 0.098 |
| 4.146902302738435 | -17.275 | 6.671 | 0.205 |
| 4.153185488045614 | -17.333 | 6.624 | 0.313 |
| 4.159468673352793 | -17.39 | 6.576 | 0.421 |
| 4.165751858659973 | -17.447 | 6.527 | 0.529 |
| 4.172035043967152 | -17.503 | 6.476 | 0.638 |
| 4.178318229274331 | -17.56 | 6.424 | 0.748 |
| 4.18460141458151 | -17.615 | 6.37 | 0.857 |
| 4.190884599888689 | -17.67 | 6.315 | 0.968 |
| 4.197167785195868 | -17.725 | 6.259 | 1.078 |
| 4.203450970503048 | -17.779 | 6.202 | 1.189 |
| 4.209734155810227 | -17.833 | 6.143 | 1.3 |
| 4.216017341117406 | -17.887 | 6.082 | 1.411 |
| 4.222300526424585 | -17.94 | 6.021 | 1.523 |
| 4.228583711731764 | -17.992 | 5.958 | 1.634 |
| 4.234866897038944 | -18.044 | 5.893 | 1.746 |
| 4.241150082346122 | -18.096 | 5.827 | 1.857 |
| 4.247433267653302 | -18.147 | 5.76 | 1.969 |
| 4.253716452960481 | -18.197 | 5.692 | 2.08 |
| 4.25999963826766 | -18.247 | 5.622 | 2.192 |
| 4.26628282357484 | -18.297 | 5.551 | 2.303 |
| 4.272566008882019 | -18.346 | 5.478 | 2.414 |
| 4.278849194189198 | -18.395 | 5.405 | 2.525 |
| 4.285132379496377 | -18.443 | 5.33 | 2.636 |
| 4.291415564803557 | -18.49 | 5.253 | 2.747 |
| 4.297698750110735 | -18.537 | 5.175 | 2.857 |
| 4.303981935417915 | -18.584 | 5.096 | 2.966 |
| 4.310265120725094 | -18.63 | 5.016 | 3.076 |
| 4.316548306032273 | -18.675 | 4.934 | 3.185 |
| 4.322831491339452 | -18.72 | 4.852 | 3.293 |
| 4.329114676646632 | -18.764 | 4.767 | 3.401 |
| 4.335397861953811 | -18.808 | 4.682 | 3.508 |
| 4.34168104726099 | -18.851 | 4.595 | 3.614 |
| 4.347964232568169 | -18.894 | 4.507 | 3.72 |
| 4.354247417875348 | -18.936 | 4.418 | 3.825 |
| 4.360530603182528 | -18.977 | 4.328 | 3.93 |
| 4.366813788489707 | -19.018 | 4.236 | 4.033 |
| 4.373096973796886 | -19.059 | 4.143 | 4.136 |
| 4.379380159104065 | -19.098 | 4.049 | 4.238 |
| 4.385663344411244 | -19.137 | 3.953 | 4.339 |
| 4.391946529718424 | -19.176 | 3.857 | 4.438 |
| 4.398229715025602 | -19.214 | 3.759 | 4.537 |
| 4.404512900332782 | -19.251 | 3.66 | 4.635 |
| 4.41079608563996 | -19.288 | 3.56 | 4.732 |
| 4.41707927094714 | -19.324 | 3.459 | 4.827 |
| 4.42336245625432 | -19.359 | 3.356 | 4.922 |
| 4.429645641561499 | -19.394 | 3.253 | 5.015 |
| 4.435928826868678 | -19.428 | 3.148 | 5.107 |
| 4.442212012175857 | -19.461 | 3.043 | 5.197 |
| 4.448495197483036 | -19.494 | 2.936 | 5.286 |
| 4.454778382790215 | -19.526 | 2.828 | 5.374 |
| 4.461061568097395 | -19.558 | 2.719 | 5.46 |
| 4.467344753404574 | -19.588 | 2.609 | 5.545 |
| 4.473627938711753 | -19.618 | 2.497 | 5.629 |
| 4.479911124018932 | -19.648 | 2.385 | 5.71 |
| 4.486194309326112 | -19.676 | 2.272 | 5.791 |
| 4.49247749463329 | -19.704 | 2.158 | 5.869 |
| 4.49876067994047 | -19.732 | 2.042 | 5.946 |
| 4.50504386524765 | -19.758 | 1.926 | 6.021 |
| 4.511327050554828 | -19.784 | 1.809 | 6.095 |
| 4.517610235862008 | -19.809 | 1.691 | 6.166 |
| 4.523893421169186 | -19.834 | 1.572 | 6.236 |
| 4.530176606476366 | -19.858 | 1.452 | 6.304 |
| 4.536459791783545 | -19.881 | 1.331 | 6.37 |
| 4.542742977090724 | -19.903 | 1.209 | 6.434 |
| 4.549026162397904 | -19.924 | 1.086 | 6.496 |
| 4.555309347705083 | -19.945 | 0.963 | 6.557 |
| 4.561592533012262 | -19.965 | 0.838 | 6.615 |
| 4.567875718319441 | -19.984 | 0.713 | 6.671 |
| 4.57415890362662 | -20.003 | 0.587 | 6.725 |
| 4.5804420889338 | -20.021 | 0.46 | 6.777 |
| 4.586725274240979 | -20.038 | 0.332 | 6.827 |
| 4.593008459548158 | -20.054 | 0.204 | 6.874 |
| 4.599291644855337 | -20.069 | 0.075 | 6.919 |
| 4.605574830162516 | -20.084 | -0.055 | 6.963 |
| 4.611858015469695 | -20.098 | -0.186 | 7.003 |
| 4.618141200776875 | -20.111 | -0.317 | 7.042 |
| 4.624424386084054 | -20.123 | -0.449 | 7.078 |
| 4.630707571391233 | -20.134 | -0.581 | 7.112 |
| 4.636990756698412 | -20.145 | -0.715 | 7.144 |
| 4.643273942005591 | -20.155 | -0.849 | 7.173 |
| 4.649557127312771 | -20.164 | -0.983 | 7.199 |
| 4.65584031261995 | -20.172 | -1.118 | 7.224 |
| 4.66212349792713 | -20.179 | -1.254 | 7.245 |
| 4.668406683234308 | -20.185 | -1.39 | 7.265 |
| 4.674689868541487 | -20.191 | -1.526 | 7.281 |
| 4.680973053848666 | -20.196 | -1.664 | 7.296 |
| 4.687256239155846 | -20.2 | -1.801 | 7.307 |
| 4.693539424463024 | -20.203 | -1.939 | 7.316 |
| 4.699822609770204 | -20.205 | -2.078 | 7.323 |
| 4.706105795077383 | -20.206 | -2.217 | 7.327 |
| 4.712388980384562 | -20.207 | -2.356 | 7.328 |
| 4.718672165691741 | -20.206 | -2.496 | 7.327 |
| 4.724955350998921 | -20.205 | -2.636 | 7.323 |
| 4.7312385363061 | -20.203 | -2.776 | 7.316 |
| 4.73752172161328 | -20.2 | -2.917 | 7.307 |
| 4.743804906920459 | -20.196 | -3.058 | 7.295 |
| 4.750088092227637 | -20.191 | -3.199 | 7.28 |
| 4.756371277534817 | -20.185 | -3.341 | 7.263 |
| 4.762654462841996 | -20.178 | -3.482 | 7.243 |
| 4.768937648149175 | -20.171 | -3.624 | 7.22 |
| 4.775220833456354 | -20.162 | -3.766 | 7.195 |
| 4.781504018763534 | -20.153 | -3.909 | 7.166 |
| 4.787787204070713 | -20.142 | -4.051 | 7.136 |
| 4.794070389377892 | -20.131 | -4.193 | 7.102 |
| 4.800353574685071 | -20.119 | -4.336 | 7.065 |
| 4.806636759992251 | -20.105 | -4.479 | 7.026 |
| 4.81291994529943 | -20.091 | -4.621 | 6.984 |
| 4.819203130606608 | -20.076 | -4.764 | 6.94 |
| 4.825486315913788 | -20.06 | -4.906 | 6.893 |
| 4.831769501220967 | -20.043 | -5.049 | 6.842 |
| 4.838052686528146 | -20.025 | -5.191 | 6.79 |
| 4.844335871835326 | -20.006 | -5.334 | 6.734 |
| 4.850619057142505 | -19.986 | -5.476 | 6.676 |
| 4.856902242449684 | -19.966 | -5.618 | 6.615 |
| 4.863185427756863 | -19.944 | -5.76 | 6.551 |
| 4.869468613064042 | -19.921 | -5.902 | 6.485 |
| 4.875751798371221 | -19.897 | -6.044 | 6.416 |
| 4.882034983678401 | -19.872 | -6.185 | 6.345 |
| 4.88831816898558 | -19.847 | -6.326 | 6.27 |
| 4.894601354292759 | -19.82 | -6.467 | 6.193 |
| 4.900884539599939 | -19.792 | -6.607 | 6.114 |
| 4.907167724907117 | -19.763 | -6.747 | 6.032 |
| 4.913450910214297 | -19.733 | -6.887 | 5.947 |
| 4.919734095521476 | -19.703 | -7.027 | 5.86 |
| 4.926017280828655 | -19.671 | -7.166 | 5.77 |
| 4.932300466135834 | -19.638 | -7.304 | 5.677 |
| 4.938583651443014 | -19.604 | -7.442 | 5.582 |
| 4.944866836750193 | -19.569 | -7.58 | 5.485 |
| 4.951150022057372 | -19.533 | -7.717 | 5.385 |
| 4.957433207364551 | -19.496 | -7.853 | 5.283 |
| 4.96371639267173 | -19.458 | -7.989 | 5.178 |
| 4.96999957797891 | -19.419 | -8.125 | 5.071 |
| 4.976282763286088 | -19.379 | -8.259 | 4.961 |
| 4.982565948593268 | -19.338 | -8.393 | 4.849 |
| 4.988849133900447 | -19.296 | -8.527 | 4.735 |
| 4.995132319207626 | -19.253 | -8.66 | 4.619 |
| 5.001415504514805 | -19.209 | -8.792 | 4.5 |
| 5.007698689821984 | -19.163 | -8.923 | 4.379 |
| 5.013981875129164 | -19.117 | -9.053 | 4.256 |
| 5.020265060436343 | -19.069 | -9.183 | 4.131 |
| 5.026548245743522 | -19.021 | -9.312 | 4.003 |
| 5.032831431050702 | -18.971 | -9.44 | 3.874 |
| 5.039114616357881 | -18.921 | -9.567 | 3.742 |
| 5.04539780166506 | -18.869 | -9.693 | 3.609 |
| 5.05168098697224 | -18.816 | -9.819 | 3.473 |
| 5.057964172279418 | -18.762 | -9.943 | 3.336 |
| 5.064247357586598 | -18.707 | -10.066 | 3.196 |
| 5.070530542893777 | -18.651 | -10.189 | 3.055 |
| 5.076813728200956 | -18.594 | -10.31 | 2.912 |
| 5.083096913508135 | -18.536 | -10.43 | 2.768 |
| 5.089380098815314 | -18.476 | -10.549 | 2.621 |
| 5.095663284122493 | -18.416 | -10.667 | 2.473 |
| 5.101946469429673 | -18.354 | -10.784 | 2.323 |
| 5.108229654736852 | -18.292 | -10.9 | 2.172 |
| 5.114512840044031 | -18.228 | -11.015 | 2.019 |
| 5.12079602535121 | -18.163 | -11.128 | 1.865 |
| 5.12707921065839 | -18.097 | -11.24 | 1.709 |
| 5.133362395965568 | -18.03 | -11.351 | 1.552 |
| 5.139645581272747 | -17.962 | -11.461 | 1.394 |
| 5.145928766579927 | -17.892 | -11.569 | 1.234 |
| 5.152211951887106 | -17.822 | -11.676 | 1.073 |
| 5.158495137194286 | -17.75 | -11.782 | 0.911 |
| 5.164778322501465 | -17.678 | -11.886 | 0.748 |
| 5.171061507808644 | -17.604 | -11.989 | 0.583 |
| 5.177344693115823 | -17.529 | -12.09 | 0.418 |
| 5.183627878423002 | -17.453 | -12.19 | 0.252 |
| 5.189911063730181 | -17.375 | -12.289 | 0.085 |
| 5.196194249037361 | -17.297 | -12.386 | -0.083 |
| 5.20247743434454 | -17.218 | -12.481 | -0.252 |
| 5.20876061965172 | -17.137 | -12.575 | -0.422 |
| 5.215043804958898 | -17.055 | -12.668 | -0.592 |
| 5.221326990266077 | -16.972 | -12.758 | -0.763 |
| 5.227610175573257 | -16.888 | -12.847 | -0.934 |
| 5.233893360880435 | -16.803 | -12.935 | -1.106 |
| 5.240176546187615 | -16.717 | -13.021 | -1.278 |
| 5.246459731494794 | -16.629 | -13.105 | -1.451 |
| 5.252742916801973 | -16.541 | -13.187 | -1.624 |
| 5.259026102109152 | -16.451 | -13.268 | -1.797 |
| 5.265309287416332 | -16.36 | -13.347 | -1.971 |
| 5.27159247272351 | -16.268 | -13.424 | -2.144 |
| 5.27787565803069 | -16.175 | -13.5 | -2.318 |
| 5.284158843337869 | -16.081 | -13.573 | -2.492 |
| 5.290442028645049 | -15.985 | -13.645 | -2.665 |
| 5.296725213952227 | -15.888 | -13.715 | -2.839 |
| 5.303008399259407 | -15.791 | -13.783 | -3.012 |
| 5.309291584566586 | -15.692 | -13.849 | -3.185 |
| 5.315574769873765 | -15.591 | -13.914 | -3.358 |
| 5.321857955180945 | -15.49 | -13.976 | -3.53 |
| 5.328141140488124 | -15.388 | -14.036 | -3.702 |
| 5.334424325795303 | -15.284 | -14.095 | -3.873 |
| 5.340707511102482 | -15.179 | -14.151 | -4.044 |
| 5.346990696409661 | -15.073 | -14.205 | -4.214 |
| 5.35327388171684 | -14.966 | -14.258 | -4.383 |
| 5.35955706702402 | -14.858 | -14.308 | -4.552 |
| 5.365840252331199 | -14.749 | -14.356 | -4.72 |
| 5.372123437638378 | -14.638 | -14.402 | -4.887 |
| 5.378406622945557 | -14.526 | -14.446 | -5.053 |
| 5.384689808252737 | -14.414 | -14.488 | -5.218 |
| 5.390972993559916 | -14.299 | -14.528 | -5.381 |
| 5.397256178867095 | -14.184 | -14.566 | -5.544 |
| 5.403539364174274 | -14.068 | -14.601 | -5.705 |
| 5.409822549481453 | -13.95 | -14.634 | -5.865 |
| 5.416105734788632 | -13.832 | -14.666 | -6.024 |
| 5.422388920095812 | -13.712 | -14.694 | -6.182 |
| 5.42867210540299 | -13.591 | -14.721 | -6.337 |
| 5.43495529071017 | -13.469 | -14.745 | -6.492 |
| 5.44123847601735 | -13.345 | -14.768 | -6.644 |
| 5.447521661324528 | -13.221 | -14.787 | -6.795 |
| 5.453804846631708 | -13.095 | -14.805 | -6.945 |
| 5.460088031938887 | -12.968 | -14.82 | -7.092 |
| 5.466371217246066 | -12.841 | -14.833 | -7.238 |
| 5.472654402553245 | -12.711 | -14.844 | -7.381 |
| 5.478937587860424 | -12.581 | -14.852 | -7.523 |
| 5.485220773167603 | -12.45 | -14.858 | -7.663 |
| 5.491503958474783 | -12.317 | -14.862 | -7.8 |
| 5.497787143781962 | -12.184 | -14.863 | -7.936 |
| 5.504070329089141 | -12.049 | -14.862 | -8.069 |
| 5.51035351439632 | -11.913 | -14.858 | -8.2 |
| 5.5166366997035 | -11.775 | -14.852 | -8.328 |
| 5.522919885010679 | -11.637 | -14.844 | -8.455 |
| 5.529203070317858 | -11.498 | -14.833 | -8.578 |
| 5.535486255625037 | -11.357 | -14.82 | -8.699 |
| 5.541769440932216 | -11.215 | -14.804 | -8.818 |
| 5.548052626239396 | -11.072 | -14.786 | -8.934 |
| 5.554335811546575 | -10.928 | -14.765 | -9.047 |
| 5.560618996853754 | -10.783 | -14.742 | -9.158 |
| 5.566902182160933 | -10.637 | -14.716 | -9.266 |
| 5.573185367468112 | -10.49 | -14.688 | -9.371 |
| 5.579468552775292 | -10.341 | -14.658 | -9.473 |
| 5.585751738082471 | -10.191 | -14.625 | -9.572 |
| 5.59203492338965 | -10.04 | -14.589 | -9.668 |
| 5.59831810869683 | -9.889 | -14.551 | -9.761 |
| 5.604601294004008 | -9.735 | -14.51 | -9.851 |
| 5.610884479311188 | -9.581 | -14.467 | -9.938 |
| 5.617167664618367 | -9.426 | -14.422 | -10.022 |
| 5.623450849925546 | -9.269 | -14.373 | -10.102 |
| 5.629734035232725 | -9.112 | -14.323 | -10.18 |
| 5.636017220539904 | -8.953 | -14.27 | -10.254 |
| 5.642300405847083 | -8.793 | -14.214 | -10.324 |
| 5.648583591154263 | -8.633 | -14.156 | -10.392 |
| 5.654866776461442 | -8.471 | -14.095 | -10.455 |
| 5.661149961768621 | -8.307 | -14.031 | -10.516 |
| 5.6674331470758 | -8.143 | -13.965 | -10.573 |
| 5.673716332382979 | -7.978 | -13.897 | -10.626 |
| 5.679999517690159 | -7.812 | -13.826 | -10.676 |
| 5.686282702997337 | -7.644 | -13.753 | -10.722 |
| 5.692565888304517 | -7.476 | -13.676 | -10.764 |
| 5.698849073611696 | -7.306 | -13.598 | -10.803 |
| 5.705132258918875 | -7.135 | -13.517 | -10.838 |
| 5.711415444226055 | -6.963 | -13.433 | -10.87 |
| 5.717698629533234 | -6.79 | -13.347 | -10.897 |
| 5.723981814840413 | -6.616 | -13.258 | -10.921 |
| 5.730265000147592 | -6.441 | -13.167 | -10.941 |
| 5.73654818545477 | -6.265 | -13.073 | -10.957 |
| 5.742831370761951 | -6.088 | -12.977 | -10.97 |
| 5.74911455606913 | -5.91 | -12.878 | -10.978 |
| 5.75539774137631 | -5.731 | -12.777 | -10.983 |
| 5.761680926683488 | -5.55 | -12.673 | -10.983 |
| 5.767964111990667 | -5.369 | -12.567 | -10.98 |
| 5.774247297297846 | -5.186 | -12.458 | -10.973 |
| 5.780530482605025 | -5.003 | -12.347 | -10.962 |
| 5.786813667912205 | -4.819 | -12.233 | -10.946 |
| 5.793096853219384 | -4.633 | -12.117 | -10.927 |
| 5.799380038526563 | -4.446 | -11.998 | -10.904 |
| 5.805663223833742 | -4.259 | -11.877 | -10.877 |
| 5.811946409140922 | -4.07 | -11.753 | -10.846 |
| 5.8182295944481 | -3.881 | -11.627 | -10.811 |
| 5.82451277975528 | -3.69 | -11.499 | -10.771 |
| 5.830795965062459 | -3.498 | -11.368 | -10.728 |
| 5.837079150369638 | -3.306 | -11.235 | -10.681 |
| 5.843362335676817 | -3.112 | -11.1 | -10.629 |
| 5.849645520983997 | -2.918 | -10.962 | -10.574 |
| 5.855928706291176 | -2.722 | -10.821 | -10.515 |
| 5.862211891598355 | -2.525 | -10.679 | -10.451 |
| 5.868495076905535 | -2.328 | -10.534 | -10.384 |
| 5.874778262212714 | -2.129 | -10.386 | -10.312 |
| 5.881061447519893 | -1.93 | -10.237 | -10.237 |
| 5.887344632827072 | -1.729 | -10.085 | -10.157 |
| 5.893627818134251 | -1.528 | -9.931 | -10.074 |
| 5.899911003441431 | -1.326 | -9.774 | -9.987 |
| 5.90619418874861 | -1.122 | -9.616 | -9.895 |
| 5.912477374055789 | -0.918 | -9.455 | -9.8 |
| 5.918760559362968 | -0.713 | -9.292 | -9.701 |
| 5.925043744670147 | -0.507 | -9.126 | -9.598 |
| 5.931326929977326 | -0.3 | -8.959 | -9.491 |
| 5.937610115284505 | -0.092 | -8.789 | -9.38 |
| 5.943893300591684 | 0.117 | -8.618 | -9.265 |
| 5.950176485898864 | 0.327 | -8.444 | -9.147 |
| 5.956459671206043 | 0.538 | -8.268 | -9.024 |
| 5.962742856513223 | 0.749 | -8.09 | -8.898 |
| 5.969026041820402 | 0.962 | -7.91 | -8.769 |
| 5.975309227127581 | 1.175 | -7.728 | -8.635 |
| 5.98159241243476 | 1.389 | -7.543 | -8.498 |
| 5.987875597741939 | 1.604 | -7.357 | -8.357 |
| 5.994158783049118 | 1.82 | -7.169 | -8.213 |
| 6.000441968356298 | 2.037 | -6.979 | -8.065 |
| 6.006725153663476 | 2.255 | -6.787 | -7.914 |
| 6.013008338970656 | 2.473 | -6.593 | -7.759 |
| 6.019291524277835 | 2.693 | -6.398 | -7.601 |
| 6.025574709585015 | 2.913 | -6.2 | -7.439 |
| 6.031857894892193 | 3.134 | -6.001 | -7.274 |
| 6.038141080199372 | 3.356 | -5.799 | -7.106 |
| 6.044424265506552 | 3.578 | -5.596 | -6.934 |
| 6.050707450813731 | 3.802 | -5.392 | -6.76 |
| 6.05699063612091 | 4.026 | -5.185 | -6.582 |
| 6.06327382142809 | 4.251 | -4.977 | -6.401 |
| 6.069557006735269 | 4.477 | -4.767 | -6.217 |
| 6.075840192042448 | 4.704 | -4.556 | -6.03 |
| 6.082123377349627 | 4.931 | -4.343 | -5.84 |
| 6.088406562656806 | 5.159 | -4.128 | -5.647 |
| 6.094689747963986 | 5.388 | -3.912 | -5.451 |
| 6.100972933271164 | 5.618 | -3.694 | -5.253 |
| 6.107256118578344 | 5.848 | -3.475 | -5.052 |
| 6.113539303885523 | 6.079 | -3.254 | -4.848 |
| 6.119822489192702 | 6.311 | -3.032 | -4.642 |
| 6.126105674499882 | 6.543 | -2.808 | -4.433 |
| 6.132388859807061 | 6.777 | -2.583 | -4.221 |
| 6.13867204511424 | 7.011 | -2.357 | -4.008 |
| 6.144955230421419 | 7.245 | -2.129 | -3.792 |
| 6.151238415728598 | 7.481 | -1.9 | -3.573 |
| 6.157521601035778 | 7.717 | -1.67 | -3.353 |
| 6.163804786342957 | 7.953 | -1.439 | -3.13 |
| 6.170087971650136 | 8.191 | -1.206 | -2.906 |
| 6.176371156957315 | 8.429 | -0.973 | -2.679 |
| 6.182654342264494 | 8.667 | -0.738 | -2.451 |
| 6.188937527571674 | 8.907 | -0.502 | -2.221 |
| 6.195220712878853 | 9.146 | -0.265 | -1.989 |
| 6.201503898186032 | 9.387 | -0.027 | -1.755 |
| 6.207787083493211 | 9.628 | 0.212 | -1.52 |
| 6.21407026880039 | 9.87 | 0.451 | -1.283 |
| 6.22035345410757 | 10.112 | 0.692 | -1.045 |
| 6.226636639414749 | 10.355 | 0.934 | -0.806 |
| 6.232919824721928 | 10.599 | 1.176 | -0.565 |
| 6.239203010029107 | 10.843 | 1.42 | -0.323 |
| 6.245486195336286 | 11.087 | 1.664 | -0.08 |
| 6.251769380643465 | 11.333 | 1.908 | 0.164 |
| 6.258052565950644 | 11.578 | 2.154 | 0.409 |
| 6.264335751257824 | 11.824 | 2.4 | 0.655 |
| 6.270618936565003 | 12.071 | 2.647 | 0.901 |
| 6.276902121872182 | 12.319 | 2.894 | 1.148 |
| 6.283185307179361 | 12.566 | 3.142 | 1.396 |